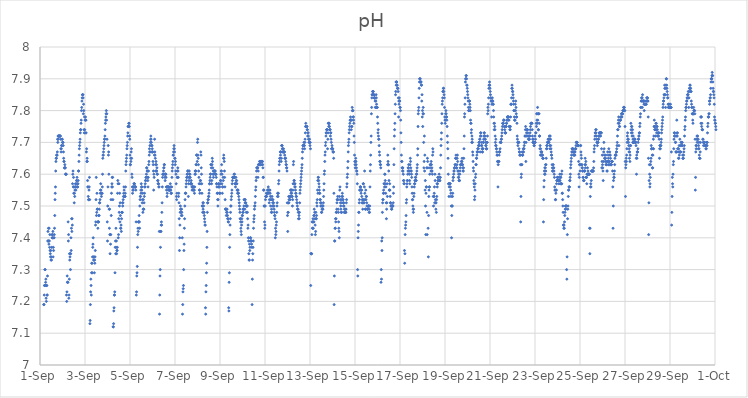
| Category | pH |
|---|---|
| 44440.166666666664 | 7.19 |
| 44440.177083333336 | 7.19 |
| 44440.1875 | 7.22 |
| 44440.197916666664 | 7.25 |
| 44440.208333333336 | 7.25 |
| 44440.21875 | 7.3 |
| 44440.229166666664 | 7.3 |
| 44440.239583333336 | 7.25 |
| 44440.25 | 7.26 |
| 44440.260416666664 | 7.27 |
| 44440.270833333336 | 7.21 |
| 44440.28125 | 7.2 |
| 44440.291666666664 | 7.25 |
| 44440.302083333336 | 7.25 |
| 44440.3125 | 7.22 |
| 44440.322916666664 | 7.22 |
| 44440.333333333336 | 7.28 |
| 44440.34375 | 7.39 |
| 44440.354166666664 | 7.42 |
| 44440.364583333336 | 7.39 |
| 44440.375 | 7.43 |
| 44440.385416666664 | 7.39 |
| 44440.395833333336 | 7.38 |
| 44440.40625 | 7.43 |
| 44440.416666666664 | 7.39 |
| 44440.427083333336 | 7.37 |
| 44440.4375 | 7.41 |
| 44440.447916666664 | 7.36 |
| 44440.458333333336 | 7.35 |
| 44440.46875 | 7.34 |
| 44440.479166666664 | 7.36 |
| 44440.489583333336 | 7.33 |
| 44440.5 | 7.34 |
| 44440.510416666664 | 7.33 |
| 44440.520833333336 | 7.37 |
| 44440.53125 | 7.41 |
| 44440.541666666664 | 7.4 |
| 44440.552083333336 | 7.4 |
| 44440.5625 | 7.41 |
| 44440.572916666664 | 7.42 |
| 44440.583333333336 | 7.34 |
| 44440.59375 | 7.37 |
| 44440.604166666664 | 7.36 |
| 44440.614583333336 | 7.4 |
| 44440.625 | 7.4 |
| 44440.635416666664 | 7.41 |
| 44440.645833333336 | 7.43 |
| 44440.65625 | 7.47 |
| 44440.666666666664 | 7.52 |
| 44440.677083333336 | 7.54 |
| 44440.6875 | 7.56 |
| 44440.697916666664 | 7.61 |
| 44440.708333333336 | 7.64 |
| 44440.71875 | 7.65 |
| 44440.729166666664 | 7.65 |
| 44440.739583333336 | 7.66 |
| 44440.75 | 7.66 |
| 44440.760416666664 | 7.66 |
| 44440.770833333336 | 7.67 |
| 44440.78125 | 7.71 |
| 44440.791666666664 | 7.7 |
| 44440.802083333336 | 7.72 |
| 44440.8125 | 7.71 |
| 44440.822916666664 | 7.72 |
| 44440.833333333336 | 7.72 |
| 44440.84375 | 7.72 |
| 44440.854166666664 | 7.72 |
| 44440.864583333336 | 7.72 |
| 44440.875 | 7.72 |
| 44440.885416666664 | 7.72 |
| 44440.895833333336 | 7.72 |
| 44440.90625 | 7.72 |
| 44440.916666666664 | 7.71 |
| 44440.927083333336 | 7.68 |
| 44440.9375 | 7.67 |
| 44440.947916666664 | 7.68 |
| 44440.958333333336 | 7.69 |
| 44440.96875 | 7.69 |
| 44440.979166666664 | 7.71 |
| 44440.989583333336 | 7.71 |
| 44441.0 | 7.7 |
| 44441.010416666664 | 7.7 |
| 44441.020833333336 | 7.7 |
| 44441.03125 | 7.69 |
| 44441.041666666664 | 7.67 |
| 44441.052083333336 | 7.65 |
| 44441.0625 | 7.64 |
| 44441.072916666664 | 7.64 |
| 44441.083333333336 | 7.62 |
| 44441.09375 | 7.62 |
| 44441.104166666664 | 7.63 |
| 44441.114583333336 | 7.62 |
| 44441.125 | 7.62 |
| 44441.135416666664 | 7.6 |
| 44441.145833333336 | 7.6 |
| 44441.15625 | 7.6 |
| 44441.166666666664 | 7.6 |
| 44441.177083333336 | 7.22 |
| 44441.1875 | 7.2 |
| 44441.197916666664 | 7.23 |
| 44441.208333333336 | 7.28 |
| 44441.21875 | 7.26 |
| 44441.229166666664 | 7.26 |
| 44441.239583333336 | 7.26 |
| 44441.25 | 7.45 |
| 44441.260416666664 | 7.39 |
| 44441.270833333336 | 7.41 |
| 44441.28125 | 7.21 |
| 44441.291666666664 | 7.22 |
| 44441.302083333336 | 7.27 |
| 44441.3125 | 7.35 |
| 44441.322916666664 | 7.33 |
| 44441.333333333336 | 7.34 |
| 44441.34375 | 7.35 |
| 44441.354166666664 | 7.3 |
| 44441.364583333336 | 7.35 |
| 44441.375 | 7.4 |
| 44441.385416666664 | 7.36 |
| 44441.395833333336 | 7.43 |
| 44441.40625 | 7.46 |
| 44441.416666666664 | 7.42 |
| 44441.427083333336 | 7.46 |
| 44441.4375 | 7.44 |
| 44441.447916666664 | 7.57 |
| 44441.458333333336 | 7.6 |
| 44441.46875 | 7.61 |
| 44441.479166666664 | 7.56 |
| 44441.489583333336 | 7.59 |
| 44441.5 | 7.54 |
| 44441.510416666664 | 7.56 |
| 44441.520833333336 | 7.51 |
| 44441.53125 | 7.54 |
| 44441.541666666664 | 7.53 |
| 44441.552083333336 | 7.55 |
| 44441.5625 | 7.56 |
| 44441.572916666664 | 7.57 |
| 44441.583333333336 | 7.56 |
| 44441.59375 | 7.55 |
| 44441.604166666664 | 7.56 |
| 44441.614583333336 | 7.57 |
| 44441.625 | 7.58 |
| 44441.635416666664 | 7.58 |
| 44441.645833333336 | 7.59 |
| 44441.65625 | 7.57 |
| 44441.666666666664 | 7.56 |
| 44441.677083333336 | 7.56 |
| 44441.6875 | 7.57 |
| 44441.697916666664 | 7.58 |
| 44441.708333333336 | 7.61 |
| 44441.71875 | 7.61 |
| 44441.729166666664 | 7.64 |
| 44441.739583333336 | 7.66 |
| 44441.75 | 7.68 |
| 44441.760416666664 | 7.69 |
| 44441.770833333336 | 7.7 |
| 44441.78125 | 7.71 |
| 44441.791666666664 | 7.73 |
| 44441.802083333336 | 7.74 |
| 44441.8125 | 7.74 |
| 44441.822916666664 | 7.76 |
| 44441.833333333336 | 7.77 |
| 44441.84375 | 7.8 |
| 44441.854166666664 | 7.81 |
| 44441.864583333336 | 7.83 |
| 44441.875 | 7.84 |
| 44441.885416666664 | 7.85 |
| 44441.895833333336 | 7.85 |
| 44441.90625 | 7.85 |
| 44441.916666666664 | 7.84 |
| 44441.927083333336 | 7.79 |
| 44441.9375 | 7.82 |
| 44441.947916666664 | 7.8 |
| 44441.958333333336 | 7.74 |
| 44441.96875 | 7.73 |
| 44441.979166666664 | 7.78 |
| 44441.989583333336 | 7.74 |
| 44442.0 | 7.77 |
| 44442.010416666664 | 7.73 |
| 44442.020833333336 | 7.78 |
| 44442.03125 | 7.77 |
| 44442.041666666664 | 7.77 |
| 44442.052083333336 | 7.73 |
| 44442.0625 | 7.67 |
| 44442.072916666664 | 7.68 |
| 44442.083333333336 | 7.64 |
| 44442.09375 | 7.65 |
| 44442.104166666664 | 7.64 |
| 44442.114583333336 | 7.58 |
| 44442.125 | 7.56 |
| 44442.135416666664 | 7.56 |
| 44442.145833333336 | 7.53 |
| 44442.15625 | 7.52 |
| 44442.166666666664 | 7.52 |
| 44442.177083333336 | 7.55 |
| 44442.1875 | 7.56 |
| 44442.197916666664 | 7.59 |
| 44442.208333333336 | 7.52 |
| 44442.21875 | 7.13 |
| 44442.229166666664 | 7.14 |
| 44442.239583333336 | 7.19 |
| 44442.25 | 7.23 |
| 44442.260416666664 | 7.27 |
| 44442.270833333336 | 7.25 |
| 44442.28125 | 7.22 |
| 44442.291666666664 | 7.29 |
| 44442.302083333336 | 7.32 |
| 44442.3125 | 7.32 |
| 44442.322916666664 | 7.29 |
| 44442.333333333336 | 7.34 |
| 44442.34375 | 7.37 |
| 44442.354166666664 | 7.38 |
| 44442.364583333336 | 7.4 |
| 44442.375 | 7.34 |
| 44442.385416666664 | 7.33 |
| 44442.395833333336 | 7.33 |
| 44442.40625 | 7.34 |
| 44442.416666666664 | 7.29 |
| 44442.427083333336 | 7.33 |
| 44442.4375 | 7.32 |
| 44442.447916666664 | 7.34 |
| 44442.458333333336 | 7.36 |
| 44442.46875 | 7.44 |
| 44442.479166666664 | 7.45 |
| 44442.489583333336 | 7.52 |
| 44442.5 | 7.59 |
| 44442.510416666664 | 7.47 |
| 44442.520833333336 | 7.48 |
| 44442.53125 | 7.54 |
| 44442.541666666664 | 7.49 |
| 44442.552083333336 | 7.49 |
| 44442.5625 | 7.45 |
| 44442.572916666664 | 7.43 |
| 44442.583333333336 | 7.45 |
| 44442.59375 | 7.45 |
| 44442.604166666664 | 7.45 |
| 44442.614583333336 | 7.47 |
| 44442.625 | 7.47 |
| 44442.635416666664 | 7.49 |
| 44442.645833333336 | 7.51 |
| 44442.65625 | 7.51 |
| 44442.666666666664 | 7.52 |
| 44442.677083333336 | 7.54 |
| 44442.6875 | 7.55 |
| 44442.697916666664 | 7.57 |
| 44442.708333333336 | 7.55 |
| 44442.71875 | 7.54 |
| 44442.729166666664 | 7.53 |
| 44442.739583333336 | 7.54 |
| 44442.75 | 7.54 |
| 44442.760416666664 | 7.54 |
| 44442.770833333336 | 7.56 |
| 44442.78125 | 7.6 |
| 44442.791666666664 | 7.65 |
| 44442.802083333336 | 7.66 |
| 44442.8125 | 7.66 |
| 44442.822916666664 | 7.67 |
| 44442.833333333336 | 7.68 |
| 44442.84375 | 7.69 |
| 44442.854166666664 | 7.7 |
| 44442.864583333336 | 7.71 |
| 44442.875 | 7.71 |
| 44442.885416666664 | 7.72 |
| 44442.895833333336 | 7.74 |
| 44442.90625 | 7.76 |
| 44442.916666666664 | 7.77 |
| 44442.927083333336 | 7.78 |
| 44442.9375 | 7.79 |
| 44442.947916666664 | 7.8 |
| 44442.958333333336 | 7.77 |
| 44442.96875 | 7.79 |
| 44442.979166666664 | 7.71 |
| 44442.989583333336 | 7.45 |
| 44443.0 | 7.39 |
| 44443.010416666664 | 7.5 |
| 44443.020833333336 | 7.56 |
| 44443.03125 | 7.69 |
| 44443.041666666664 | 7.66 |
| 44443.052083333336 | 7.67 |
| 44443.0625 | 7.6 |
| 44443.072916666664 | 7.49 |
| 44443.083333333336 | 7.43 |
| 44443.09375 | 7.49 |
| 44443.104166666664 | 7.41 |
| 44443.114583333336 | 7.35 |
| 44443.125 | 7.41 |
| 44443.135416666664 | 7.38 |
| 44443.145833333336 | 7.41 |
| 44443.15625 | 7.52 |
| 44443.166666666664 | 7.47 |
| 44443.177083333336 | 7.54 |
| 44443.1875 | 7.56 |
| 44443.197916666664 | 7.57 |
| 44443.208333333336 | 7.59 |
| 44443.21875 | 7.56 |
| 44443.229166666664 | 7.59 |
| 44443.239583333336 | 7.52 |
| 44443.25 | 7.12 |
| 44443.260416666664 | 7.12 |
| 44443.270833333336 | 7.13 |
| 44443.28125 | 7.17 |
| 44443.291666666664 | 7.18 |
| 44443.302083333336 | 7.22 |
| 44443.3125 | 7.22 |
| 44443.322916666664 | 7.23 |
| 44443.333333333336 | 7.29 |
| 44443.34375 | 7.37 |
| 44443.354166666664 | 7.39 |
| 44443.364583333336 | 7.35 |
| 44443.375 | 7.43 |
| 44443.385416666664 | 7.37 |
| 44443.395833333336 | 7.39 |
| 44443.40625 | 7.35 |
| 44443.416666666664 | 7.36 |
| 44443.427083333336 | 7.36 |
| 44443.4375 | 7.37 |
| 44443.447916666664 | 7.54 |
| 44443.458333333336 | 7.58 |
| 44443.46875 | 7.57 |
| 44443.479166666664 | 7.4 |
| 44443.489583333336 | 7.41 |
| 44443.5 | 7.46 |
| 44443.510416666664 | 7.57 |
| 44443.520833333336 | 7.48 |
| 44443.53125 | 7.5 |
| 44443.541666666664 | 7.54 |
| 44443.552083333336 | 7.45 |
| 44443.5625 | 7.51 |
| 44443.572916666664 | 7.47 |
| 44443.583333333336 | 7.43 |
| 44443.59375 | 7.43 |
| 44443.604166666664 | 7.44 |
| 44443.614583333336 | 7.42 |
| 44443.625 | 7.46 |
| 44443.635416666664 | 7.48 |
| 44443.645833333336 | 7.48 |
| 44443.65625 | 7.48 |
| 44443.666666666664 | 7.51 |
| 44443.677083333336 | 7.5 |
| 44443.6875 | 7.51 |
| 44443.697916666664 | 7.52 |
| 44443.708333333336 | 7.53 |
| 44443.71875 | 7.54 |
| 44443.729166666664 | 7.56 |
| 44443.739583333336 | 7.55 |
| 44443.75 | 7.53 |
| 44443.760416666664 | 7.53 |
| 44443.770833333336 | 7.53 |
| 44443.78125 | 7.53 |
| 44443.791666666664 | 7.54 |
| 44443.802083333336 | 7.56 |
| 44443.8125 | 7.61 |
| 44443.822916666664 | 7.63 |
| 44443.833333333336 | 7.64 |
| 44443.84375 | 7.65 |
| 44443.854166666664 | 7.66 |
| 44443.864583333336 | 7.68 |
| 44443.875 | 7.69 |
| 44443.885416666664 | 7.7 |
| 44443.895833333336 | 7.72 |
| 44443.90625 | 7.73 |
| 44443.916666666664 | 7.75 |
| 44443.927083333336 | 7.75 |
| 44443.9375 | 7.75 |
| 44443.947916666664 | 7.76 |
| 44443.958333333336 | 7.76 |
| 44443.96875 | 7.75 |
| 44443.979166666664 | 7.72 |
| 44443.989583333336 | 7.71 |
| 44444.0 | 7.66 |
| 44444.010416666664 | 7.63 |
| 44444.020833333336 | 7.63 |
| 44444.03125 | 7.65 |
| 44444.041666666664 | 7.64 |
| 44444.052083333336 | 7.67 |
| 44444.0625 | 7.68 |
| 44444.072916666664 | 7.65 |
| 44444.083333333336 | 7.6 |
| 44444.09375 | 7.59 |
| 44444.104166666664 | 7.56 |
| 44444.114583333336 | 7.54 |
| 44444.125 | 7.55 |
| 44444.135416666664 | 7.56 |
| 44444.145833333336 | 7.55 |
| 44444.15625 | 7.56 |
| 44444.166666666664 | 7.56 |
| 44444.177083333336 | 7.57 |
| 44444.1875 | 7.57 |
| 44444.197916666664 | 7.57 |
| 44444.208333333336 | 7.56 |
| 44444.21875 | 7.56 |
| 44444.229166666664 | 7.56 |
| 44444.239583333336 | 7.56 |
| 44444.25 | 7.56 |
| 44444.260416666664 | 7.55 |
| 44444.270833333336 | 7.45 |
| 44444.28125 | 7.22 |
| 44444.291666666664 | 7.23 |
| 44444.302083333336 | 7.28 |
| 44444.3125 | 7.29 |
| 44444.322916666664 | 7.31 |
| 44444.333333333336 | 7.37 |
| 44444.34375 | 7.41 |
| 44444.354166666664 | 7.43 |
| 44444.364583333336 | 7.42 |
| 44444.375 | 7.45 |
| 44444.385416666664 | 7.45 |
| 44444.395833333336 | 7.45 |
| 44444.40625 | 7.47 |
| 44444.416666666664 | 7.45 |
| 44444.427083333336 | 7.43 |
| 44444.4375 | 7.5 |
| 44444.447916666664 | 7.52 |
| 44444.458333333336 | 7.53 |
| 44444.46875 | 7.53 |
| 44444.479166666664 | 7.55 |
| 44444.489583333336 | 7.54 |
| 44444.5 | 7.57 |
| 44444.510416666664 | 7.56 |
| 44444.520833333336 | 7.55 |
| 44444.53125 | 7.56 |
| 44444.541666666664 | 7.51 |
| 44444.552083333336 | 7.52 |
| 44444.5625 | 7.54 |
| 44444.572916666664 | 7.48 |
| 44444.583333333336 | 7.49 |
| 44444.59375 | 7.52 |
| 44444.604166666664 | 7.49 |
| 44444.614583333336 | 7.49 |
| 44444.625 | 7.51 |
| 44444.635416666664 | 7.53 |
| 44444.645833333336 | 7.54 |
| 44444.65625 | 7.56 |
| 44444.666666666664 | 7.56 |
| 44444.677083333336 | 7.57 |
| 44444.6875 | 7.58 |
| 44444.697916666664 | 7.58 |
| 44444.708333333336 | 7.59 |
| 44444.71875 | 7.59 |
| 44444.729166666664 | 7.6 |
| 44444.739583333336 | 7.62 |
| 44444.75 | 7.62 |
| 44444.760416666664 | 7.61 |
| 44444.770833333336 | 7.61 |
| 44444.78125 | 7.59 |
| 44444.791666666664 | 7.58 |
| 44444.802083333336 | 7.56 |
| 44444.8125 | 7.59 |
| 44444.822916666664 | 7.61 |
| 44444.833333333336 | 7.63 |
| 44444.84375 | 7.64 |
| 44444.854166666664 | 7.66 |
| 44444.864583333336 | 7.68 |
| 44444.875 | 7.67 |
| 44444.885416666664 | 7.69 |
| 44444.895833333336 | 7.67 |
| 44444.90625 | 7.7 |
| 44444.916666666664 | 7.71 |
| 44444.927083333336 | 7.72 |
| 44444.9375 | 7.71 |
| 44444.947916666664 | 7.7 |
| 44444.958333333336 | 7.69 |
| 44444.96875 | 7.67 |
| 44444.979166666664 | 7.69 |
| 44444.989583333336 | 7.68 |
| 44445.0 | 7.67 |
| 44445.010416666664 | 7.67 |
| 44445.020833333336 | 7.64 |
| 44445.03125 | 7.63 |
| 44445.041666666664 | 7.61 |
| 44445.052083333336 | 7.55 |
| 44445.0625 | 7.6 |
| 44445.072916666664 | 7.59 |
| 44445.083333333336 | 7.66 |
| 44445.09375 | 7.71 |
| 44445.104166666664 | 7.67 |
| 44445.114583333336 | 7.66 |
| 44445.125 | 7.65 |
| 44445.135416666664 | 7.63 |
| 44445.145833333336 | 7.61 |
| 44445.15625 | 7.64 |
| 44445.166666666664 | 7.61 |
| 44445.177083333336 | 7.63 |
| 44445.1875 | 7.61 |
| 44445.197916666664 | 7.62 |
| 44445.208333333336 | 7.6 |
| 44445.21875 | 7.6 |
| 44445.229166666664 | 7.58 |
| 44445.239583333336 | 7.58 |
| 44445.25 | 7.57 |
| 44445.260416666664 | 7.57 |
| 44445.270833333336 | 7.57 |
| 44445.28125 | 7.56 |
| 44445.291666666664 | 7.56 |
| 44445.302083333336 | 7.42 |
| 44445.3125 | 7.16 |
| 44445.322916666664 | 7.22 |
| 44445.333333333336 | 7.28 |
| 44445.34375 | 7.3 |
| 44445.354166666664 | 7.37 |
| 44445.364583333336 | 7.42 |
| 44445.375 | 7.42 |
| 44445.385416666664 | 7.44 |
| 44445.395833333336 | 7.45 |
| 44445.40625 | 7.44 |
| 44445.416666666664 | 7.48 |
| 44445.427083333336 | 7.51 |
| 44445.4375 | 7.56 |
| 44445.447916666664 | 7.59 |
| 44445.458333333336 | 7.6 |
| 44445.46875 | 7.6 |
| 44445.479166666664 | 7.6 |
| 44445.489583333336 | 7.61 |
| 44445.5 | 7.62 |
| 44445.510416666664 | 7.62 |
| 44445.520833333336 | 7.63 |
| 44445.53125 | 7.63 |
| 44445.541666666664 | 7.6 |
| 44445.552083333336 | 7.59 |
| 44445.5625 | 7.58 |
| 44445.572916666664 | 7.6 |
| 44445.583333333336 | 7.6 |
| 44445.59375 | 7.6 |
| 44445.604166666664 | 7.59 |
| 44445.614583333336 | 7.56 |
| 44445.625 | 7.55 |
| 44445.635416666664 | 7.56 |
| 44445.645833333336 | 7.53 |
| 44445.65625 | 7.54 |
| 44445.666666666664 | 7.56 |
| 44445.677083333336 | 7.56 |
| 44445.6875 | 7.56 |
| 44445.697916666664 | 7.56 |
| 44445.708333333336 | 7.55 |
| 44445.71875 | 7.56 |
| 44445.729166666664 | 7.56 |
| 44445.739583333336 | 7.55 |
| 44445.75 | 7.55 |
| 44445.760416666664 | 7.55 |
| 44445.770833333336 | 7.55 |
| 44445.78125 | 7.55 |
| 44445.791666666664 | 7.57 |
| 44445.802083333336 | 7.56 |
| 44445.8125 | 7.55 |
| 44445.822916666664 | 7.54 |
| 44445.833333333336 | 7.54 |
| 44445.84375 | 7.54 |
| 44445.854166666664 | 7.56 |
| 44445.864583333336 | 7.59 |
| 44445.875 | 7.61 |
| 44445.885416666664 | 7.62 |
| 44445.895833333336 | 7.63 |
| 44445.90625 | 7.64 |
| 44445.916666666664 | 7.66 |
| 44445.927083333336 | 7.66 |
| 44445.9375 | 7.67 |
| 44445.947916666664 | 7.68 |
| 44445.958333333336 | 7.69 |
| 44445.96875 | 7.68 |
| 44445.979166666664 | 7.67 |
| 44445.989583333336 | 7.65 |
| 44446.0 | 7.65 |
| 44446.010416666664 | 7.63 |
| 44446.020833333336 | 7.64 |
| 44446.03125 | 7.61 |
| 44446.041666666664 | 7.6 |
| 44446.052083333336 | 7.57 |
| 44446.0625 | 7.53 |
| 44446.072916666664 | 7.52 |
| 44446.083333333336 | 7.54 |
| 44446.09375 | 7.59 |
| 44446.104166666664 | 7.61 |
| 44446.114583333336 | 7.59 |
| 44446.125 | 7.62 |
| 44446.135416666664 | 7.61 |
| 44446.145833333336 | 7.59 |
| 44446.15625 | 7.53 |
| 44446.166666666664 | 7.54 |
| 44446.177083333336 | 7.51 |
| 44446.1875 | 7.46 |
| 44446.197916666664 | 7.36 |
| 44446.208333333336 | 7.4 |
| 44446.21875 | 7.44 |
| 44446.229166666664 | 7.48 |
| 44446.239583333336 | 7.5 |
| 44446.25 | 7.49 |
| 44446.260416666664 | 7.49 |
| 44446.270833333336 | 7.48 |
| 44446.28125 | 7.47 |
| 44446.291666666664 | 7.49 |
| 44446.302083333336 | 7.48 |
| 44446.3125 | 7.47 |
| 44446.322916666664 | 7.4 |
| 44446.333333333336 | 7.16 |
| 44446.34375 | 7.19 |
| 44446.354166666664 | 7.23 |
| 44446.364583333336 | 7.24 |
| 44446.375 | 7.25 |
| 44446.385416666664 | 7.3 |
| 44446.395833333336 | 7.36 |
| 44446.40625 | 7.38 |
| 44446.416666666664 | 7.43 |
| 44446.427083333336 | 7.46 |
| 44446.4375 | 7.5 |
| 44446.447916666664 | 7.52 |
| 44446.458333333336 | 7.54 |
| 44446.46875 | 7.54 |
| 44446.479166666664 | 7.54 |
| 44446.489583333336 | 7.56 |
| 44446.5 | 7.57 |
| 44446.510416666664 | 7.58 |
| 44446.520833333336 | 7.59 |
| 44446.53125 | 7.59 |
| 44446.541666666664 | 7.6 |
| 44446.552083333336 | 7.6 |
| 44446.5625 | 7.61 |
| 44446.572916666664 | 7.61 |
| 44446.583333333336 | 7.61 |
| 44446.59375 | 7.53 |
| 44446.604166666664 | 7.57 |
| 44446.614583333336 | 7.59 |
| 44446.625 | 7.58 |
| 44446.635416666664 | 7.61 |
| 44446.645833333336 | 7.6 |
| 44446.65625 | 7.59 |
| 44446.666666666664 | 7.6 |
| 44446.677083333336 | 7.59 |
| 44446.6875 | 7.57 |
| 44446.697916666664 | 7.57 |
| 44446.708333333336 | 7.57 |
| 44446.71875 | 7.58 |
| 44446.729166666664 | 7.57 |
| 44446.739583333336 | 7.57 |
| 44446.75 | 7.56 |
| 44446.760416666664 | 7.55 |
| 44446.770833333336 | 7.56 |
| 44446.78125 | 7.56 |
| 44446.791666666664 | 7.56 |
| 44446.802083333336 | 7.55 |
| 44446.8125 | 7.56 |
| 44446.822916666664 | 7.55 |
| 44446.833333333336 | 7.56 |
| 44446.84375 | 7.55 |
| 44446.854166666664 | 7.55 |
| 44446.864583333336 | 7.54 |
| 44446.875 | 7.56 |
| 44446.885416666664 | 7.6 |
| 44446.895833333336 | 7.61 |
| 44446.90625 | 7.6 |
| 44446.916666666664 | 7.61 |
| 44446.927083333336 | 7.61 |
| 44446.9375 | 7.63 |
| 44446.947916666664 | 7.63 |
| 44446.958333333336 | 7.66 |
| 44446.96875 | 7.66 |
| 44446.979166666664 | 7.66 |
| 44446.989583333336 | 7.64 |
| 44447.0 | 7.7 |
| 44447.010416666664 | 7.71 |
| 44447.020833333336 | 7.66 |
| 44447.03125 | 7.65 |
| 44447.041666666664 | 7.63 |
| 44447.052083333336 | 7.61 |
| 44447.0625 | 7.59 |
| 44447.072916666664 | 7.57 |
| 44447.083333333336 | 7.55 |
| 44447.09375 | 7.55 |
| 44447.104166666664 | 7.54 |
| 44447.114583333336 | 7.57 |
| 44447.125 | 7.58 |
| 44447.135416666664 | 7.58 |
| 44447.145833333336 | 7.67 |
| 44447.15625 | 7.66 |
| 44447.166666666664 | 7.62 |
| 44447.177083333336 | 7.6 |
| 44447.1875 | 7.57 |
| 44447.197916666664 | 7.54 |
| 44447.208333333336 | 7.5 |
| 44447.21875 | 7.5 |
| 44447.229166666664 | 7.48 |
| 44447.239583333336 | 7.51 |
| 44447.25 | 7.49 |
| 44447.260416666664 | 7.51 |
| 44447.270833333336 | 7.5 |
| 44447.28125 | 7.48 |
| 44447.291666666664 | 7.48 |
| 44447.302083333336 | 7.47 |
| 44447.3125 | 7.46 |
| 44447.322916666664 | 7.45 |
| 44447.333333333336 | 7.44 |
| 44447.34375 | 7.44 |
| 44447.354166666664 | 7.18 |
| 44447.364583333336 | 7.16 |
| 44447.375 | 7.23 |
| 44447.385416666664 | 7.25 |
| 44447.395833333336 | 7.29 |
| 44447.40625 | 7.32 |
| 44447.416666666664 | 7.37 |
| 44447.427083333336 | 7.42 |
| 44447.4375 | 7.48 |
| 44447.447916666664 | 7.51 |
| 44447.458333333336 | 7.51 |
| 44447.46875 | 7.52 |
| 44447.479166666664 | 7.52 |
| 44447.489583333336 | 7.53 |
| 44447.5 | 7.53 |
| 44447.510416666664 | 7.54 |
| 44447.520833333336 | 7.55 |
| 44447.53125 | 7.57 |
| 44447.541666666664 | 7.57 |
| 44447.552083333336 | 7.58 |
| 44447.5625 | 7.59 |
| 44447.572916666664 | 7.6 |
| 44447.583333333336 | 7.6 |
| 44447.59375 | 7.63 |
| 44447.604166666664 | 7.63 |
| 44447.614583333336 | 7.62 |
| 44447.625 | 7.57 |
| 44447.635416666664 | 7.58 |
| 44447.645833333336 | 7.63 |
| 44447.65625 | 7.65 |
| 44447.666666666664 | 7.64 |
| 44447.677083333336 | 7.62 |
| 44447.6875 | 7.6 |
| 44447.697916666664 | 7.61 |
| 44447.708333333336 | 7.59 |
| 44447.71875 | 7.6 |
| 44447.729166666664 | 7.61 |
| 44447.739583333336 | 7.61 |
| 44447.75 | 7.61 |
| 44447.760416666664 | 7.61 |
| 44447.770833333336 | 7.61 |
| 44447.78125 | 7.6 |
| 44447.791666666664 | 7.61 |
| 44447.802083333336 | 7.6 |
| 44447.8125 | 7.6 |
| 44447.822916666664 | 7.6 |
| 44447.833333333336 | 7.59 |
| 44447.84375 | 7.57 |
| 44447.854166666664 | 7.57 |
| 44447.864583333336 | 7.56 |
| 44447.875 | 7.54 |
| 44447.885416666664 | 7.54 |
| 44447.895833333336 | 7.52 |
| 44447.90625 | 7.5 |
| 44447.916666666664 | 7.52 |
| 44447.927083333336 | 7.56 |
| 44447.9375 | 7.57 |
| 44447.947916666664 | 7.57 |
| 44447.958333333336 | 7.56 |
| 44447.96875 | 7.54 |
| 44447.979166666664 | 7.56 |
| 44447.989583333336 | 7.54 |
| 44448.0 | 7.54 |
| 44448.010416666664 | 7.57 |
| 44448.020833333336 | 7.58 |
| 44448.03125 | 7.58 |
| 44448.041666666664 | 7.6 |
| 44448.052083333336 | 7.61 |
| 44448.0625 | 7.61 |
| 44448.072916666664 | 7.63 |
| 44448.083333333336 | 7.57 |
| 44448.09375 | 7.6 |
| 44448.104166666664 | 7.54 |
| 44448.114583333336 | 7.56 |
| 44448.125 | 7.56 |
| 44448.135416666664 | 7.59 |
| 44448.145833333336 | 7.58 |
| 44448.15625 | 7.65 |
| 44448.166666666664 | 7.66 |
| 44448.177083333336 | 7.65 |
| 44448.1875 | 7.64 |
| 44448.197916666664 | 7.61 |
| 44448.208333333336 | 7.59 |
| 44448.21875 | 7.56 |
| 44448.229166666664 | 7.52 |
| 44448.239583333336 | 7.49 |
| 44448.25 | 7.49 |
| 44448.260416666664 | 7.49 |
| 44448.270833333336 | 7.49 |
| 44448.28125 | 7.47 |
| 44448.291666666664 | 7.48 |
| 44448.302083333336 | 7.49 |
| 44448.3125 | 7.49 |
| 44448.322916666664 | 7.48 |
| 44448.333333333336 | 7.47 |
| 44448.34375 | 7.46 |
| 44448.354166666664 | 7.46 |
| 44448.364583333336 | 7.45 |
| 44448.375 | 7.45 |
| 44448.385416666664 | 7.18 |
| 44448.395833333336 | 7.17 |
| 44448.40625 | 7.26 |
| 44448.416666666664 | 7.29 |
| 44448.427083333336 | 7.37 |
| 44448.4375 | 7.41 |
| 44448.447916666664 | 7.44 |
| 44448.458333333336 | 7.46 |
| 44448.46875 | 7.48 |
| 44448.479166666664 | 7.5 |
| 44448.489583333336 | 7.5 |
| 44448.5 | 7.52 |
| 44448.510416666664 | 7.53 |
| 44448.520833333336 | 7.54 |
| 44448.53125 | 7.55 |
| 44448.541666666664 | 7.57 |
| 44448.552083333336 | 7.58 |
| 44448.5625 | 7.59 |
| 44448.572916666664 | 7.59 |
| 44448.583333333336 | 7.59 |
| 44448.59375 | 7.59 |
| 44448.604166666664 | 7.59 |
| 44448.614583333336 | 7.59 |
| 44448.625 | 7.6 |
| 44448.635416666664 | 7.59 |
| 44448.645833333336 | 7.6 |
| 44448.65625 | 7.59 |
| 44448.666666666664 | 7.57 |
| 44448.677083333336 | 7.57 |
| 44448.6875 | 7.56 |
| 44448.697916666664 | 7.57 |
| 44448.708333333336 | 7.59 |
| 44448.71875 | 7.58 |
| 44448.729166666664 | 7.57 |
| 44448.739583333336 | 7.58 |
| 44448.75 | 7.57 |
| 44448.760416666664 | 7.55 |
| 44448.770833333336 | 7.55 |
| 44448.78125 | 7.54 |
| 44448.791666666664 | 7.55 |
| 44448.802083333336 | 7.55 |
| 44448.8125 | 7.54 |
| 44448.822916666664 | 7.54 |
| 44448.833333333336 | 7.53 |
| 44448.84375 | 7.52 |
| 44448.854166666664 | 7.51 |
| 44448.864583333336 | 7.5 |
| 44448.875 | 7.49 |
| 44448.885416666664 | 7.48 |
| 44448.895833333336 | 7.46 |
| 44448.90625 | 7.46 |
| 44448.916666666664 | 7.45 |
| 44448.927083333336 | 7.43 |
| 44448.9375 | 7.42 |
| 44448.947916666664 | 7.41 |
| 44448.958333333336 | 7.44 |
| 44448.96875 | 7.46 |
| 44448.979166666664 | 7.45 |
| 44448.989583333336 | 7.47 |
| 44449.0 | 7.47 |
| 44449.010416666664 | 7.48 |
| 44449.020833333336 | 7.49 |
| 44449.03125 | 7.48 |
| 44449.041666666664 | 7.49 |
| 44449.052083333336 | 7.49 |
| 44449.0625 | 7.5 |
| 44449.072916666664 | 7.52 |
| 44449.083333333336 | 7.52 |
| 44449.09375 | 7.52 |
| 44449.104166666664 | 7.49 |
| 44449.114583333336 | 7.51 |
| 44449.125 | 7.52 |
| 44449.135416666664 | 7.51 |
| 44449.145833333336 | 7.51 |
| 44449.15625 | 7.5 |
| 44449.166666666664 | 7.48 |
| 44449.177083333336 | 7.5 |
| 44449.1875 | 7.5 |
| 44449.197916666664 | 7.5 |
| 44449.208333333336 | 7.5 |
| 44449.21875 | 7.48 |
| 44449.229166666664 | 7.46 |
| 44449.239583333336 | 7.43 |
| 44449.25 | 7.44 |
| 44449.260416666664 | 7.4 |
| 44449.270833333336 | 7.39 |
| 44449.28125 | 7.35 |
| 44449.291666666664 | 7.33 |
| 44449.302083333336 | 7.33 |
| 44449.3125 | 7.38 |
| 44449.322916666664 | 7.36 |
| 44449.333333333336 | 7.37 |
| 44449.34375 | 7.4 |
| 44449.354166666664 | 7.39 |
| 44449.364583333336 | 7.4 |
| 44449.375 | 7.39 |
| 44449.385416666664 | 7.39 |
| 44449.395833333336 | 7.39 |
| 44449.40625 | 7.38 |
| 44449.416666666664 | 7.37 |
| 44449.427083333336 | 7.19 |
| 44449.4375 | 7.27 |
| 44449.447916666664 | 7.33 |
| 44449.458333333336 | 7.35 |
| 44449.46875 | 7.37 |
| 44449.479166666664 | 7.39 |
| 44449.489583333336 | 7.43 |
| 44449.5 | 7.45 |
| 44449.510416666664 | 7.46 |
| 44449.520833333336 | 7.47 |
| 44449.53125 | 7.49 |
| 44449.541666666664 | 7.5 |
| 44449.552083333336 | 7.5 |
| 44449.5625 | 7.51 |
| 44449.572916666664 | 7.53 |
| 44449.583333333336 | 7.55 |
| 44449.59375 | 7.56 |
| 44449.604166666664 | 7.58 |
| 44449.614583333336 | 7.59 |
| 44449.625 | 7.61 |
| 44449.635416666664 | 7.62 |
| 44449.645833333336 | 7.62 |
| 44449.65625 | 7.62 |
| 44449.666666666664 | 7.62 |
| 44449.677083333336 | 7.62 |
| 44449.6875 | 7.59 |
| 44449.697916666664 | 7.61 |
| 44449.708333333336 | 7.63 |
| 44449.71875 | 7.63 |
| 44449.729166666664 | 7.63 |
| 44449.739583333336 | 7.63 |
| 44449.75 | 7.63 |
| 44449.760416666664 | 7.64 |
| 44449.770833333336 | 7.64 |
| 44449.78125 | 7.63 |
| 44449.791666666664 | 7.63 |
| 44449.802083333336 | 7.64 |
| 44449.8125 | 7.63 |
| 44449.822916666664 | 7.64 |
| 44449.833333333336 | 7.64 |
| 44449.84375 | 7.64 |
| 44449.854166666664 | 7.64 |
| 44449.864583333336 | 7.63 |
| 44449.875 | 7.64 |
| 44449.885416666664 | 7.64 |
| 44449.895833333336 | 7.63 |
| 44449.90625 | 7.62 |
| 44449.916666666664 | 7.59 |
| 44449.927083333336 | 7.59 |
| 44449.9375 | 7.55 |
| 44449.947916666664 | 7.55 |
| 44449.958333333336 | 7.5 |
| 44449.96875 | 7.5 |
| 44449.979166666664 | 7.45 |
| 44449.989583333336 | 7.43 |
| 44450.0 | 7.44 |
| 44450.010416666664 | 7.5 |
| 44450.020833333336 | 7.52 |
| 44450.03125 | 7.53 |
| 44450.041666666664 | 7.53 |
| 44450.052083333336 | 7.53 |
| 44450.0625 | 7.54 |
| 44450.072916666664 | 7.53 |
| 44450.083333333336 | 7.54 |
| 44450.09375 | 7.54 |
| 44450.104166666664 | 7.54 |
| 44450.114583333336 | 7.55 |
| 44450.125 | 7.55 |
| 44450.135416666664 | 7.54 |
| 44450.145833333336 | 7.56 |
| 44450.15625 | 7.55 |
| 44450.166666666664 | 7.55 |
| 44450.177083333336 | 7.54 |
| 44450.1875 | 7.51 |
| 44450.197916666664 | 7.52 |
| 44450.208333333336 | 7.55 |
| 44450.21875 | 7.55 |
| 44450.229166666664 | 7.54 |
| 44450.239583333336 | 7.53 |
| 44450.25 | 7.5 |
| 44450.260416666664 | 7.52 |
| 44450.270833333336 | 7.52 |
| 44450.28125 | 7.48 |
| 44450.291666666664 | 7.49 |
| 44450.302083333336 | 7.48 |
| 44450.3125 | 7.53 |
| 44450.322916666664 | 7.52 |
| 44450.333333333336 | 7.5 |
| 44450.34375 | 7.51 |
| 44450.354166666664 | 7.52 |
| 44450.364583333336 | 7.51 |
| 44450.375 | 7.51 |
| 44450.385416666664 | 7.5 |
| 44450.395833333336 | 7.5 |
| 44450.40625 | 7.49 |
| 44450.416666666664 | 7.48 |
| 44450.427083333336 | 7.47 |
| 44450.4375 | 7.47 |
| 44450.447916666664 | 7.46 |
| 44450.458333333336 | 7.4 |
| 44450.46875 | 7.43 |
| 44450.479166666664 | 7.41 |
| 44450.489583333336 | 7.42 |
| 44450.5 | 7.44 |
| 44450.510416666664 | 7.45 |
| 44450.520833333336 | 7.48 |
| 44450.53125 | 7.5 |
| 44450.541666666664 | 7.51 |
| 44450.552083333336 | 7.53 |
| 44450.5625 | 7.54 |
| 44450.572916666664 | 7.54 |
| 44450.583333333336 | 7.53 |
| 44450.59375 | 7.54 |
| 44450.604166666664 | 7.57 |
| 44450.614583333336 | 7.58 |
| 44450.625 | 7.61 |
| 44450.635416666664 | 7.63 |
| 44450.645833333336 | 7.64 |
| 44450.65625 | 7.65 |
| 44450.666666666664 | 7.65 |
| 44450.677083333336 | 7.67 |
| 44450.6875 | 7.66 |
| 44450.697916666664 | 7.67 |
| 44450.708333333336 | 7.67 |
| 44450.71875 | 7.64 |
| 44450.729166666664 | 7.65 |
| 44450.739583333336 | 7.69 |
| 44450.75 | 7.69 |
| 44450.760416666664 | 7.69 |
| 44450.770833333336 | 7.68 |
| 44450.78125 | 7.68 |
| 44450.791666666664 | 7.67 |
| 44450.802083333336 | 7.67 |
| 44450.8125 | 7.67 |
| 44450.822916666664 | 7.68 |
| 44450.833333333336 | 7.67 |
| 44450.84375 | 7.67 |
| 44450.854166666664 | 7.67 |
| 44450.864583333336 | 7.67 |
| 44450.875 | 7.66 |
| 44450.885416666664 | 7.65 |
| 44450.895833333336 | 7.65 |
| 44450.90625 | 7.65 |
| 44450.916666666664 | 7.65 |
| 44450.927083333336 | 7.64 |
| 44450.9375 | 7.63 |
| 44450.947916666664 | 7.63 |
| 44450.958333333336 | 7.62 |
| 44450.96875 | 7.62 |
| 44450.979166666664 | 7.61 |
| 44450.989583333336 | 7.51 |
| 44451.0 | 7.47 |
| 44451.010416666664 | 7.42 |
| 44451.020833333336 | 7.48 |
| 44451.03125 | 7.48 |
| 44451.041666666664 | 7.51 |
| 44451.052083333336 | 7.53 |
| 44451.0625 | 7.51 |
| 44451.072916666664 | 7.52 |
| 44451.083333333336 | 7.52 |
| 44451.09375 | 7.53 |
| 44451.104166666664 | 7.53 |
| 44451.114583333336 | 7.52 |
| 44451.125 | 7.53 |
| 44451.135416666664 | 7.55 |
| 44451.145833333336 | 7.55 |
| 44451.15625 | 7.54 |
| 44451.166666666664 | 7.55 |
| 44451.177083333336 | 7.55 |
| 44451.1875 | 7.54 |
| 44451.197916666664 | 7.53 |
| 44451.208333333336 | 7.53 |
| 44451.21875 | 7.5 |
| 44451.229166666664 | 7.52 |
| 44451.239583333336 | 7.55 |
| 44451.25 | 7.57 |
| 44451.260416666664 | 7.63 |
| 44451.270833333336 | 7.64 |
| 44451.28125 | 7.57 |
| 44451.291666666664 | 7.58 |
| 44451.302083333336 | 7.58 |
| 44451.3125 | 7.57 |
| 44451.322916666664 | 7.56 |
| 44451.333333333336 | 7.57 |
| 44451.34375 | 7.56 |
| 44451.354166666664 | 7.55 |
| 44451.364583333336 | 7.54 |
| 44451.375 | 7.54 |
| 44451.385416666664 | 7.53 |
| 44451.395833333336 | 7.53 |
| 44451.40625 | 7.52 |
| 44451.416666666664 | 7.51 |
| 44451.427083333336 | 7.51 |
| 44451.4375 | 7.5 |
| 44451.447916666664 | 7.49 |
| 44451.458333333336 | 7.49 |
| 44451.46875 | 7.49 |
| 44451.479166666664 | 7.48 |
| 44451.489583333336 | 7.46 |
| 44451.5 | 7.48 |
| 44451.510416666664 | 7.47 |
| 44451.520833333336 | 7.46 |
| 44451.53125 | 7.48 |
| 44451.541666666664 | 7.51 |
| 44451.552083333336 | 7.54 |
| 44451.5625 | 7.55 |
| 44451.572916666664 | 7.56 |
| 44451.583333333336 | 7.57 |
| 44451.59375 | 7.58 |
| 44451.604166666664 | 7.59 |
| 44451.614583333336 | 7.6 |
| 44451.625 | 7.61 |
| 44451.635416666664 | 7.62 |
| 44451.645833333336 | 7.63 |
| 44451.65625 | 7.65 |
| 44451.666666666664 | 7.67 |
| 44451.677083333336 | 7.68 |
| 44451.6875 | 7.69 |
| 44451.697916666664 | 7.69 |
| 44451.708333333336 | 7.69 |
| 44451.71875 | 7.69 |
| 44451.729166666664 | 7.7 |
| 44451.739583333336 | 7.69 |
| 44451.75 | 7.69 |
| 44451.760416666664 | 7.68 |
| 44451.770833333336 | 7.7 |
| 44451.78125 | 7.71 |
| 44451.791666666664 | 7.73 |
| 44451.802083333336 | 7.75 |
| 44451.8125 | 7.76 |
| 44451.822916666664 | 7.75 |
| 44451.833333333336 | 7.75 |
| 44451.84375 | 7.75 |
| 44451.854166666664 | 7.75 |
| 44451.864583333336 | 7.75 |
| 44451.875 | 7.74 |
| 44451.885416666664 | 7.74 |
| 44451.895833333336 | 7.72 |
| 44451.90625 | 7.73 |
| 44451.916666666664 | 7.73 |
| 44451.927083333336 | 7.72 |
| 44451.9375 | 7.71 |
| 44451.947916666664 | 7.71 |
| 44451.958333333336 | 7.7 |
| 44451.96875 | 7.7 |
| 44451.979166666664 | 7.71 |
| 44451.989583333336 | 7.7 |
| 44452.0 | 7.69 |
| 44452.010416666664 | 7.7 |
| 44452.020833333336 | 7.68 |
| 44452.03125 | 7.25 |
| 44452.041666666664 | 7.35 |
| 44452.052083333336 | 7.35 |
| 44452.0625 | 7.35 |
| 44452.072916666664 | 7.35 |
| 44452.083333333336 | 7.41 |
| 44452.09375 | 7.45 |
| 44452.104166666664 | 7.43 |
| 44452.114583333336 | 7.45 |
| 44452.125 | 7.43 |
| 44452.135416666664 | 7.46 |
| 44452.145833333336 | 7.43 |
| 44452.15625 | 7.45 |
| 44452.166666666664 | 7.47 |
| 44452.177083333336 | 7.45 |
| 44452.1875 | 7.49 |
| 44452.197916666664 | 7.47 |
| 44452.208333333336 | 7.48 |
| 44452.21875 | 7.46 |
| 44452.229166666664 | 7.44 |
| 44452.239583333336 | 7.41 |
| 44452.25 | 7.42 |
| 44452.260416666664 | 7.48 |
| 44452.270833333336 | 7.46 |
| 44452.28125 | 7.46 |
| 44452.291666666664 | 7.47 |
| 44452.302083333336 | 7.51 |
| 44452.3125 | 7.5 |
| 44452.322916666664 | 7.52 |
| 44452.333333333336 | 7.55 |
| 44452.34375 | 7.58 |
| 44452.354166666664 | 7.54 |
| 44452.364583333336 | 7.59 |
| 44452.375 | 7.59 |
| 44452.385416666664 | 7.58 |
| 44452.395833333336 | 7.57 |
| 44452.40625 | 7.56 |
| 44452.416666666664 | 7.55 |
| 44452.427083333336 | 7.54 |
| 44452.4375 | 7.54 |
| 44452.447916666664 | 7.52 |
| 44452.458333333336 | 7.52 |
| 44452.46875 | 7.51 |
| 44452.479166666664 | 7.5 |
| 44452.489583333336 | 7.51 |
| 44452.5 | 7.5 |
| 44452.510416666664 | 7.48 |
| 44452.520833333336 | 7.48 |
| 44452.53125 | 7.49 |
| 44452.541666666664 | 7.5 |
| 44452.552083333336 | 7.5 |
| 44452.5625 | 7.49 |
| 44452.572916666664 | 7.49 |
| 44452.583333333336 | 7.5 |
| 44452.59375 | 7.51 |
| 44452.604166666664 | 7.53 |
| 44452.614583333336 | 7.55 |
| 44452.625 | 7.57 |
| 44452.635416666664 | 7.6 |
| 44452.645833333336 | 7.61 |
| 44452.65625 | 7.64 |
| 44452.666666666664 | 7.66 |
| 44452.677083333336 | 7.67 |
| 44452.6875 | 7.69 |
| 44452.697916666664 | 7.7 |
| 44452.708333333336 | 7.72 |
| 44452.71875 | 7.73 |
| 44452.729166666664 | 7.73 |
| 44452.739583333336 | 7.74 |
| 44452.75 | 7.74 |
| 44452.760416666664 | 7.74 |
| 44452.770833333336 | 7.74 |
| 44452.78125 | 7.68 |
| 44452.791666666664 | 7.71 |
| 44452.802083333336 | 7.73 |
| 44452.8125 | 7.76 |
| 44452.822916666664 | 7.76 |
| 44452.833333333336 | 7.75 |
| 44452.84375 | 7.76 |
| 44452.854166666664 | 7.76 |
| 44452.864583333336 | 7.75 |
| 44452.875 | 7.74 |
| 44452.885416666664 | 7.74 |
| 44452.895833333336 | 7.74 |
| 44452.90625 | 7.72 |
| 44452.916666666664 | 7.73 |
| 44452.927083333336 | 7.73 |
| 44452.9375 | 7.71 |
| 44452.947916666664 | 7.7 |
| 44452.958333333336 | 7.68 |
| 44452.96875 | 7.68 |
| 44452.979166666664 | 7.69 |
| 44452.989583333336 | 7.68 |
| 44453.0 | 7.68 |
| 44453.010416666664 | 7.68 |
| 44453.020833333336 | 7.67 |
| 44453.03125 | 7.67 |
| 44453.041666666664 | 7.67 |
| 44453.052083333336 | 7.65 |
| 44453.0625 | 7.54 |
| 44453.072916666664 | 7.19 |
| 44453.083333333336 | 7.28 |
| 44453.09375 | 7.39 |
| 44453.104166666664 | 7.39 |
| 44453.114583333336 | 7.43 |
| 44453.125 | 7.43 |
| 44453.135416666664 | 7.46 |
| 44453.145833333336 | 7.45 |
| 44453.15625 | 7.46 |
| 44453.166666666664 | 7.48 |
| 44453.177083333336 | 7.48 |
| 44453.1875 | 7.49 |
| 44453.197916666664 | 7.51 |
| 44453.208333333336 | 7.52 |
| 44453.21875 | 7.52 |
| 44453.229166666664 | 7.53 |
| 44453.239583333336 | 7.52 |
| 44453.25 | 7.49 |
| 44453.260416666664 | 7.48 |
| 44453.270833333336 | 7.45 |
| 44453.28125 | 7.43 |
| 44453.291666666664 | 7.42 |
| 44453.302083333336 | 7.4 |
| 44453.3125 | 7.53 |
| 44453.322916666664 | 7.55 |
| 44453.333333333336 | 7.56 |
| 44453.34375 | 7.52 |
| 44453.354166666664 | 7.51 |
| 44453.364583333336 | 7.5 |
| 44453.375 | 7.49 |
| 44453.385416666664 | 7.48 |
| 44453.395833333336 | 7.52 |
| 44453.40625 | 7.48 |
| 44453.416666666664 | 7.51 |
| 44453.427083333336 | 7.53 |
| 44453.4375 | 7.54 |
| 44453.447916666664 | 7.53 |
| 44453.458333333336 | 7.52 |
| 44453.46875 | 7.52 |
| 44453.479166666664 | 7.51 |
| 44453.489583333336 | 7.5 |
| 44453.5 | 7.51 |
| 44453.510416666664 | 7.5 |
| 44453.520833333336 | 7.48 |
| 44453.53125 | 7.49 |
| 44453.541666666664 | 7.48 |
| 44453.552083333336 | 7.49 |
| 44453.5625 | 7.49 |
| 44453.572916666664 | 7.48 |
| 44453.583333333336 | 7.48 |
| 44453.59375 | 7.48 |
| 44453.604166666664 | 7.49 |
| 44453.614583333336 | 7.51 |
| 44453.625 | 7.52 |
| 44453.635416666664 | 7.56 |
| 44453.645833333336 | 7.57 |
| 44453.65625 | 7.59 |
| 44453.666666666664 | 7.6 |
| 44453.677083333336 | 7.62 |
| 44453.6875 | 7.64 |
| 44453.697916666664 | 7.67 |
| 44453.708333333336 | 7.69 |
| 44453.71875 | 7.7 |
| 44453.729166666664 | 7.71 |
| 44453.739583333336 | 7.73 |
| 44453.75 | 7.74 |
| 44453.760416666664 | 7.75 |
| 44453.770833333336 | 7.76 |
| 44453.78125 | 7.77 |
| 44453.791666666664 | 7.77 |
| 44453.802083333336 | 7.78 |
| 44453.8125 | 7.77 |
| 44453.822916666664 | 7.77 |
| 44453.833333333336 | 7.74 |
| 44453.84375 | 7.75 |
| 44453.854166666664 | 7.77 |
| 44453.864583333336 | 7.75 |
| 44453.875 | 7.81 |
| 44453.885416666664 | 7.8 |
| 44453.895833333336 | 7.8 |
| 44453.90625 | 7.8 |
| 44453.916666666664 | 7.78 |
| 44453.927083333336 | 7.78 |
| 44453.9375 | 7.77 |
| 44453.947916666664 | 7.76 |
| 44453.958333333336 | 7.72 |
| 44453.96875 | 7.7 |
| 44453.979166666664 | 7.66 |
| 44453.989583333336 | 7.64 |
| 44454.0 | 7.63 |
| 44454.010416666664 | 7.62 |
| 44454.020833333336 | 7.64 |
| 44454.03125 | 7.65 |
| 44454.041666666664 | 7.64 |
| 44454.052083333336 | 7.63 |
| 44454.0625 | 7.62 |
| 44454.072916666664 | 7.61 |
| 44454.083333333336 | 7.61 |
| 44454.09375 | 7.6 |
| 44454.104166666664 | 7.57 |
| 44454.114583333336 | 7.3 |
| 44454.125 | 7.28 |
| 44454.135416666664 | 7.4 |
| 44454.145833333336 | 7.42 |
| 44454.15625 | 7.44 |
| 44454.166666666664 | 7.48 |
| 44454.177083333336 | 7.48 |
| 44454.1875 | 7.51 |
| 44454.197916666664 | 7.52 |
| 44454.208333333336 | 7.55 |
| 44454.21875 | 7.55 |
| 44454.229166666664 | 7.56 |
| 44454.239583333336 | 7.56 |
| 44454.25 | 7.56 |
| 44454.260416666664 | 7.55 |
| 44454.270833333336 | 7.54 |
| 44454.28125 | 7.55 |
| 44454.291666666664 | 7.55 |
| 44454.302083333336 | 7.53 |
| 44454.3125 | 7.51 |
| 44454.322916666664 | 7.52 |
| 44454.333333333336 | 7.51 |
| 44454.34375 | 7.49 |
| 44454.354166666664 | 7.52 |
| 44454.364583333336 | 7.57 |
| 44454.375 | 7.57 |
| 44454.385416666664 | 7.51 |
| 44454.395833333336 | 7.52 |
| 44454.40625 | 7.51 |
| 44454.416666666664 | 7.56 |
| 44454.427083333336 | 7.61 |
| 44454.4375 | 7.54 |
| 44454.447916666664 | 7.52 |
| 44454.458333333336 | 7.49 |
| 44454.46875 | 7.49 |
| 44454.479166666664 | 7.55 |
| 44454.489583333336 | 7.52 |
| 44454.5 | 7.53 |
| 44454.510416666664 | 7.53 |
| 44454.520833333336 | 7.51 |
| 44454.53125 | 7.5 |
| 44454.541666666664 | 7.49 |
| 44454.552083333336 | 7.49 |
| 44454.5625 | 7.49 |
| 44454.572916666664 | 7.49 |
| 44454.583333333336 | 7.5 |
| 44454.59375 | 7.5 |
| 44454.604166666664 | 7.5 |
| 44454.614583333336 | 7.5 |
| 44454.625 | 7.48 |
| 44454.635416666664 | 7.49 |
| 44454.645833333336 | 7.48 |
| 44454.65625 | 7.5 |
| 44454.666666666664 | 7.56 |
| 44454.677083333336 | 7.61 |
| 44454.6875 | 7.63 |
| 44454.697916666664 | 7.66 |
| 44454.708333333336 | 7.7 |
| 44454.71875 | 7.72 |
| 44454.729166666664 | 7.79 |
| 44454.739583333336 | 7.81 |
| 44454.75 | 7.84 |
| 44454.760416666664 | 7.85 |
| 44454.770833333336 | 7.85 |
| 44454.78125 | 7.86 |
| 44454.791666666664 | 7.85 |
| 44454.802083333336 | 7.86 |
| 44454.8125 | 7.86 |
| 44454.822916666664 | 7.85 |
| 44454.833333333336 | 7.85 |
| 44454.84375 | 7.85 |
| 44454.854166666664 | 7.84 |
| 44454.864583333336 | 7.84 |
| 44454.875 | 7.84 |
| 44454.885416666664 | 7.84 |
| 44454.895833333336 | 7.83 |
| 44454.90625 | 7.81 |
| 44454.916666666664 | 7.81 |
| 44454.927083333336 | 7.83 |
| 44454.9375 | 7.85 |
| 44454.947916666664 | 7.84 |
| 44454.958333333336 | 7.82 |
| 44454.96875 | 7.81 |
| 44454.979166666664 | 7.81 |
| 44454.989583333336 | 7.81 |
| 44455.0 | 7.78 |
| 44455.010416666664 | 7.76 |
| 44455.020833333336 | 7.73 |
| 44455.03125 | 7.74 |
| 44455.041666666664 | 7.72 |
| 44455.052083333336 | 7.71 |
| 44455.0625 | 7.71 |
| 44455.072916666664 | 7.69 |
| 44455.083333333336 | 7.67 |
| 44455.09375 | 7.66 |
| 44455.104166666664 | 7.64 |
| 44455.114583333336 | 7.64 |
| 44455.125 | 7.63 |
| 44455.135416666664 | 7.63 |
| 44455.145833333336 | 7.62 |
| 44455.15625 | 7.26 |
| 44455.166666666664 | 7.3 |
| 44455.177083333336 | 7.27 |
| 44455.1875 | 7.39 |
| 44455.197916666664 | 7.36 |
| 44455.208333333336 | 7.4 |
| 44455.21875 | 7.48 |
| 44455.229166666664 | 7.51 |
| 44455.239583333336 | 7.52 |
| 44455.25 | 7.52 |
| 44455.260416666664 | 7.54 |
| 44455.270833333336 | 7.55 |
| 44455.28125 | 7.54 |
| 44455.291666666664 | 7.57 |
| 44455.302083333336 | 7.57 |
| 44455.3125 | 7.56 |
| 44455.322916666664 | 7.6 |
| 44455.333333333336 | 7.6 |
| 44455.34375 | 7.58 |
| 44455.354166666664 | 7.57 |
| 44455.364583333336 | 7.54 |
| 44455.375 | 7.56 |
| 44455.385416666664 | 7.51 |
| 44455.395833333336 | 7.46 |
| 44455.40625 | 7.49 |
| 44455.416666666664 | 7.51 |
| 44455.427083333336 | 7.57 |
| 44455.4375 | 7.53 |
| 44455.447916666664 | 7.63 |
| 44455.458333333336 | 7.66 |
| 44455.46875 | 7.64 |
| 44455.479166666664 | 7.63 |
| 44455.489583333336 | 7.63 |
| 44455.5 | 7.61 |
| 44455.510416666664 | 7.58 |
| 44455.520833333336 | 7.55 |
| 44455.53125 | 7.55 |
| 44455.541666666664 | 7.57 |
| 44455.552083333336 | 7.55 |
| 44455.5625 | 7.53 |
| 44455.572916666664 | 7.51 |
| 44455.583333333336 | 7.51 |
| 44455.59375 | 7.5 |
| 44455.604166666664 | 7.5 |
| 44455.614583333336 | 7.5 |
| 44455.625 | 7.49 |
| 44455.635416666664 | 7.49 |
| 44455.645833333336 | 7.5 |
| 44455.65625 | 7.5 |
| 44455.666666666664 | 7.5 |
| 44455.677083333336 | 7.5 |
| 44455.6875 | 7.5 |
| 44455.697916666664 | 7.51 |
| 44455.708333333336 | 7.54 |
| 44455.71875 | 7.56 |
| 44455.729166666664 | 7.63 |
| 44455.739583333336 | 7.68 |
| 44455.75 | 7.72 |
| 44455.760416666664 | 7.74 |
| 44455.770833333336 | 7.76 |
| 44455.78125 | 7.79 |
| 44455.791666666664 | 7.82 |
| 44455.802083333336 | 7.85 |
| 44455.8125 | 7.86 |
| 44455.822916666664 | 7.89 |
| 44455.833333333336 | 7.88 |
| 44455.84375 | 7.89 |
| 44455.854166666664 | 7.89 |
| 44455.864583333336 | 7.88 |
| 44455.875 | 7.88 |
| 44455.885416666664 | 7.87 |
| 44455.895833333336 | 7.87 |
| 44455.90625 | 7.87 |
| 44455.916666666664 | 7.86 |
| 44455.927083333336 | 7.84 |
| 44455.9375 | 7.78 |
| 44455.947916666664 | 7.83 |
| 44455.958333333336 | 7.82 |
| 44455.96875 | 7.84 |
| 44455.979166666664 | 7.83 |
| 44455.989583333336 | 7.83 |
| 44456.0 | 7.81 |
| 44456.010416666664 | 7.81 |
| 44456.020833333336 | 7.8 |
| 44456.03125 | 7.77 |
| 44456.041666666664 | 7.73 |
| 44456.052083333336 | 7.7 |
| 44456.0625 | 7.66 |
| 44456.072916666664 | 7.64 |
| 44456.083333333336 | 7.64 |
| 44456.09375 | 7.62 |
| 44456.104166666664 | 7.62 |
| 44456.114583333336 | 7.61 |
| 44456.125 | 7.62 |
| 44456.135416666664 | 7.61 |
| 44456.145833333336 | 7.6 |
| 44456.15625 | 7.58 |
| 44456.166666666664 | 7.58 |
| 44456.177083333336 | 7.57 |
| 44456.1875 | 7.57 |
| 44456.197916666664 | 7.36 |
| 44456.208333333336 | 7.32 |
| 44456.21875 | 7.35 |
| 44456.229166666664 | 7.41 |
| 44456.239583333336 | 7.43 |
| 44456.25 | 7.44 |
| 44456.260416666664 | 7.45 |
| 44456.270833333336 | 7.47 |
| 44456.28125 | 7.51 |
| 44456.291666666664 | 7.52 |
| 44456.302083333336 | 7.56 |
| 44456.3125 | 7.57 |
| 44456.322916666664 | 7.58 |
| 44456.333333333336 | 7.58 |
| 44456.34375 | 7.6 |
| 44456.354166666664 | 7.61 |
| 44456.364583333336 | 7.62 |
| 44456.375 | 7.62 |
| 44456.385416666664 | 7.63 |
| 44456.395833333336 | 7.61 |
| 44456.40625 | 7.61 |
| 44456.416666666664 | 7.6 |
| 44456.427083333336 | 7.58 |
| 44456.4375 | 7.57 |
| 44456.447916666664 | 7.63 |
| 44456.458333333336 | 7.65 |
| 44456.46875 | 7.64 |
| 44456.479166666664 | 7.62 |
| 44456.489583333336 | 7.61 |
| 44456.5 | 7.61 |
| 44456.510416666664 | 7.6 |
| 44456.520833333336 | 7.59 |
| 44456.53125 | 7.56 |
| 44456.541666666664 | 7.54 |
| 44456.552083333336 | 7.52 |
| 44456.5625 | 7.52 |
| 44456.572916666664 | 7.5 |
| 44456.583333333336 | 7.49 |
| 44456.59375 | 7.48 |
| 44456.604166666664 | 7.49 |
| 44456.614583333336 | 7.53 |
| 44456.625 | 7.54 |
| 44456.635416666664 | 7.56 |
| 44456.645833333336 | 7.57 |
| 44456.65625 | 7.57 |
| 44456.666666666664 | 7.58 |
| 44456.677083333336 | 7.58 |
| 44456.6875 | 7.59 |
| 44456.697916666664 | 7.59 |
| 44456.708333333336 | 7.58 |
| 44456.71875 | 7.58 |
| 44456.729166666664 | 7.6 |
| 44456.739583333336 | 7.6 |
| 44456.75 | 7.61 |
| 44456.760416666664 | 7.62 |
| 44456.770833333336 | 7.63 |
| 44456.78125 | 7.66 |
| 44456.791666666664 | 7.68 |
| 44456.802083333336 | 7.75 |
| 44456.8125 | 7.79 |
| 44456.822916666664 | 7.8 |
| 44456.833333333336 | 7.81 |
| 44456.84375 | 7.84 |
| 44456.854166666664 | 7.87 |
| 44456.864583333336 | 7.89 |
| 44456.875 | 7.9 |
| 44456.885416666664 | 7.9 |
| 44456.895833333336 | 7.9 |
| 44456.90625 | 7.89 |
| 44456.916666666664 | 7.89 |
| 44456.927083333336 | 7.89 |
| 44456.9375 | 7.89 |
| 44456.947916666664 | 7.88 |
| 44456.958333333336 | 7.88 |
| 44456.96875 | 7.83 |
| 44456.979166666664 | 7.85 |
| 44456.989583333336 | 7.78 |
| 44457.0 | 7.8 |
| 44457.010416666664 | 7.75 |
| 44457.020833333336 | 7.79 |
| 44457.03125 | 7.81 |
| 44457.041666666664 | 7.79 |
| 44457.052083333336 | 7.7 |
| 44457.0625 | 7.62 |
| 44457.072916666664 | 7.64 |
| 44457.083333333336 | 7.72 |
| 44457.09375 | 7.61 |
| 44457.104166666664 | 7.66 |
| 44457.114583333336 | 7.55 |
| 44457.125 | 7.58 |
| 44457.135416666664 | 7.5 |
| 44457.145833333336 | 7.41 |
| 44457.15625 | 7.54 |
| 44457.166666666664 | 7.56 |
| 44457.177083333336 | 7.56 |
| 44457.1875 | 7.62 |
| 44457.197916666664 | 7.48 |
| 44457.208333333336 | 7.41 |
| 44457.21875 | 7.65 |
| 44457.229166666664 | 7.64 |
| 44457.239583333336 | 7.62 |
| 44457.25 | 7.43 |
| 44457.260416666664 | 7.34 |
| 44457.270833333336 | 7.47 |
| 44457.28125 | 7.53 |
| 44457.291666666664 | 7.55 |
| 44457.302083333336 | 7.56 |
| 44457.3125 | 7.56 |
| 44457.322916666664 | 7.6 |
| 44457.333333333336 | 7.62 |
| 44457.34375 | 7.63 |
| 44457.354166666664 | 7.63 |
| 44457.364583333336 | 7.63 |
| 44457.375 | 7.61 |
| 44457.385416666664 | 7.64 |
| 44457.395833333336 | 7.63 |
| 44457.40625 | 7.61 |
| 44457.416666666664 | 7.62 |
| 44457.427083333336 | 7.61 |
| 44457.4375 | 7.6 |
| 44457.447916666664 | 7.66 |
| 44457.458333333336 | 7.68 |
| 44457.46875 | 7.67 |
| 44457.479166666664 | 7.53 |
| 44457.489583333336 | 7.5 |
| 44457.5 | 7.53 |
| 44457.510416666664 | 7.53 |
| 44457.520833333336 | 7.54 |
| 44457.53125 | 7.56 |
| 44457.541666666664 | 7.51 |
| 44457.552083333336 | 7.6 |
| 44457.5625 | 7.58 |
| 44457.572916666664 | 7.52 |
| 44457.583333333336 | 7.51 |
| 44457.59375 | 7.49 |
| 44457.604166666664 | 7.51 |
| 44457.614583333336 | 7.48 |
| 44457.625 | 7.52 |
| 44457.635416666664 | 7.53 |
| 44457.645833333336 | 7.57 |
| 44457.65625 | 7.56 |
| 44457.666666666664 | 7.57 |
| 44457.677083333336 | 7.59 |
| 44457.6875 | 7.58 |
| 44457.697916666664 | 7.59 |
| 44457.708333333336 | 7.58 |
| 44457.71875 | 7.58 |
| 44457.729166666664 | 7.58 |
| 44457.739583333336 | 7.6 |
| 44457.75 | 7.58 |
| 44457.760416666664 | 7.58 |
| 44457.770833333336 | 7.58 |
| 44457.78125 | 7.59 |
| 44457.791666666664 | 7.59 |
| 44457.802083333336 | 7.62 |
| 44457.8125 | 7.66 |
| 44457.822916666664 | 7.69 |
| 44457.833333333336 | 7.71 |
| 44457.84375 | 7.73 |
| 44457.854166666664 | 7.76 |
| 44457.864583333336 | 7.79 |
| 44457.875 | 7.82 |
| 44457.885416666664 | 7.83 |
| 44457.895833333336 | 7.84 |
| 44457.90625 | 7.86 |
| 44457.916666666664 | 7.86 |
| 44457.927083333336 | 7.87 |
| 44457.9375 | 7.87 |
| 44457.947916666664 | 7.86 |
| 44457.958333333336 | 7.85 |
| 44457.96875 | 7.84 |
| 44457.979166666664 | 7.81 |
| 44457.989583333336 | 7.78 |
| 44458.0 | 7.77 |
| 44458.010416666664 | 7.76 |
| 44458.020833333336 | 7.77 |
| 44458.03125 | 7.79 |
| 44458.041666666664 | 7.8 |
| 44458.052083333336 | 7.79 |
| 44458.0625 | 7.78 |
| 44458.072916666664 | 7.78 |
| 44458.083333333336 | 7.77 |
| 44458.09375 | 7.75 |
| 44458.104166666664 | 7.72 |
| 44458.114583333336 | 7.7 |
| 44458.125 | 7.68 |
| 44458.135416666664 | 7.65 |
| 44458.145833333336 | 7.6 |
| 44458.15625 | 7.57 |
| 44458.166666666664 | 7.57 |
| 44458.177083333336 | 7.53 |
| 44458.1875 | 7.56 |
| 44458.197916666664 | 7.57 |
| 44458.208333333336 | 7.57 |
| 44458.21875 | 7.57 |
| 44458.229166666664 | 7.57 |
| 44458.239583333336 | 7.56 |
| 44458.25 | 7.55 |
| 44458.260416666664 | 7.54 |
| 44458.270833333336 | 7.53 |
| 44458.28125 | 7.5 |
| 44458.291666666664 | 7.4 |
| 44458.302083333336 | 7.47 |
| 44458.3125 | 7.5 |
| 44458.322916666664 | 7.5 |
| 44458.333333333336 | 7.53 |
| 44458.34375 | 7.54 |
| 44458.354166666664 | 7.58 |
| 44458.364583333336 | 7.59 |
| 44458.375 | 7.59 |
| 44458.385416666664 | 7.6 |
| 44458.395833333336 | 7.61 |
| 44458.40625 | 7.61 |
| 44458.416666666664 | 7.62 |
| 44458.427083333336 | 7.62 |
| 44458.4375 | 7.62 |
| 44458.447916666664 | 7.63 |
| 44458.458333333336 | 7.63 |
| 44458.46875 | 7.65 |
| 44458.479166666664 | 7.65 |
| 44458.489583333336 | 7.66 |
| 44458.5 | 7.65 |
| 44458.510416666664 | 7.62 |
| 44458.520833333336 | 7.62 |
| 44458.53125 | 7.63 |
| 44458.541666666664 | 7.65 |
| 44458.552083333336 | 7.66 |
| 44458.5625 | 7.64 |
| 44458.572916666664 | 7.61 |
| 44458.583333333336 | 7.61 |
| 44458.59375 | 7.59 |
| 44458.604166666664 | 7.6 |
| 44458.614583333336 | 7.59 |
| 44458.625 | 7.58 |
| 44458.635416666664 | 7.58 |
| 44458.645833333336 | 7.58 |
| 44458.65625 | 7.6 |
| 44458.666666666664 | 7.61 |
| 44458.677083333336 | 7.62 |
| 44458.6875 | 7.63 |
| 44458.697916666664 | 7.63 |
| 44458.708333333336 | 7.63 |
| 44458.71875 | 7.63 |
| 44458.729166666664 | 7.64 |
| 44458.739583333336 | 7.64 |
| 44458.75 | 7.64 |
| 44458.760416666664 | 7.65 |
| 44458.770833333336 | 7.63 |
| 44458.78125 | 7.63 |
| 44458.791666666664 | 7.62 |
| 44458.802083333336 | 7.61 |
| 44458.8125 | 7.61 |
| 44458.822916666664 | 7.62 |
| 44458.833333333336 | 7.65 |
| 44458.84375 | 7.68 |
| 44458.854166666664 | 7.72 |
| 44458.864583333336 | 7.78 |
| 44458.875 | 7.79 |
| 44458.885416666664 | 7.82 |
| 44458.895833333336 | 7.84 |
| 44458.90625 | 7.89 |
| 44458.916666666664 | 7.9 |
| 44458.927083333336 | 7.9 |
| 44458.9375 | 7.91 |
| 44458.947916666664 | 7.91 |
| 44458.958333333336 | 7.9 |
| 44458.96875 | 7.88 |
| 44458.979166666664 | 7.88 |
| 44458.989583333336 | 7.87 |
| 44459.0 | 7.86 |
| 44459.010416666664 | 7.85 |
| 44459.020833333336 | 7.84 |
| 44459.03125 | 7.83 |
| 44459.041666666664 | 7.81 |
| 44459.052083333336 | 7.8 |
| 44459.0625 | 7.8 |
| 44459.072916666664 | 7.83 |
| 44459.083333333336 | 7.83 |
| 44459.09375 | 7.83 |
| 44459.104166666664 | 7.82 |
| 44459.114583333336 | 7.81 |
| 44459.125 | 7.8 |
| 44459.135416666664 | 7.77 |
| 44459.145833333336 | 7.76 |
| 44459.15625 | 7.76 |
| 44459.166666666664 | 7.73 |
| 44459.177083333336 | 7.74 |
| 44459.1875 | 7.7 |
| 44459.197916666664 | 7.72 |
| 44459.208333333336 | 7.71 |
| 44459.21875 | 7.7 |
| 44459.229166666664 | 7.67 |
| 44459.239583333336 | 7.66 |
| 44459.25 | 7.64 |
| 44459.260416666664 | 7.62 |
| 44459.270833333336 | 7.61 |
| 44459.28125 | 7.58 |
| 44459.291666666664 | 7.57 |
| 44459.302083333336 | 7.56 |
| 44459.3125 | 7.52 |
| 44459.322916666664 | 7.53 |
| 44459.333333333336 | 7.55 |
| 44459.34375 | 7.57 |
| 44459.354166666664 | 7.59 |
| 44459.364583333336 | 7.6 |
| 44459.375 | 7.63 |
| 44459.385416666664 | 7.63 |
| 44459.395833333336 | 7.65 |
| 44459.40625 | 7.65 |
| 44459.416666666664 | 7.66 |
| 44459.427083333336 | 7.67 |
| 44459.4375 | 7.67 |
| 44459.447916666664 | 7.67 |
| 44459.458333333336 | 7.68 |
| 44459.46875 | 7.68 |
| 44459.479166666664 | 7.68 |
| 44459.489583333336 | 7.69 |
| 44459.5 | 7.69 |
| 44459.510416666664 | 7.7 |
| 44459.520833333336 | 7.7 |
| 44459.53125 | 7.69 |
| 44459.541666666664 | 7.71 |
| 44459.552083333336 | 7.71 |
| 44459.5625 | 7.67 |
| 44459.572916666664 | 7.72 |
| 44459.583333333336 | 7.73 |
| 44459.59375 | 7.73 |
| 44459.604166666664 | 7.72 |
| 44459.614583333336 | 7.7 |
| 44459.625 | 7.69 |
| 44459.635416666664 | 7.69 |
| 44459.645833333336 | 7.68 |
| 44459.65625 | 7.67 |
| 44459.666666666664 | 7.67 |
| 44459.677083333336 | 7.68 |
| 44459.6875 | 7.68 |
| 44459.697916666664 | 7.7 |
| 44459.708333333336 | 7.7 |
| 44459.71875 | 7.71 |
| 44459.729166666664 | 7.72 |
| 44459.739583333336 | 7.73 |
| 44459.75 | 7.73 |
| 44459.760416666664 | 7.72 |
| 44459.770833333336 | 7.72 |
| 44459.78125 | 7.71 |
| 44459.791666666664 | 7.71 |
| 44459.802083333336 | 7.7 |
| 44459.8125 | 7.69 |
| 44459.822916666664 | 7.69 |
| 44459.833333333336 | 7.68 |
| 44459.84375 | 7.68 |
| 44459.854166666664 | 7.68 |
| 44459.864583333336 | 7.7 |
| 44459.875 | 7.7 |
| 44459.885416666664 | 7.72 |
| 44459.895833333336 | 7.79 |
| 44459.90625 | 7.81 |
| 44459.916666666664 | 7.8 |
| 44459.927083333336 | 7.82 |
| 44459.9375 | 7.84 |
| 44459.947916666664 | 7.87 |
| 44459.958333333336 | 7.88 |
| 44459.96875 | 7.88 |
| 44459.979166666664 | 7.89 |
| 44459.989583333336 | 7.88 |
| 44460.0 | 7.87 |
| 44460.010416666664 | 7.86 |
| 44460.020833333336 | 7.85 |
| 44460.03125 | 7.84 |
| 44460.041666666664 | 7.84 |
| 44460.052083333336 | 7.83 |
| 44460.0625 | 7.83 |
| 44460.072916666664 | 7.78 |
| 44460.083333333336 | 7.82 |
| 44460.09375 | 7.83 |
| 44460.104166666664 | 7.84 |
| 44460.114583333336 | 7.83 |
| 44460.125 | 7.83 |
| 44460.135416666664 | 7.82 |
| 44460.145833333336 | 7.82 |
| 44460.15625 | 7.8 |
| 44460.166666666664 | 7.78 |
| 44460.177083333336 | 7.76 |
| 44460.1875 | 7.74 |
| 44460.197916666664 | 7.76 |
| 44460.208333333336 | 7.75 |
| 44460.21875 | 7.74 |
| 44460.229166666664 | 7.72 |
| 44460.239583333336 | 7.7 |
| 44460.25 | 7.69 |
| 44460.260416666664 | 7.71 |
| 44460.270833333336 | 7.69 |
| 44460.28125 | 7.68 |
| 44460.291666666664 | 7.68 |
| 44460.302083333336 | 7.67 |
| 44460.3125 | 7.66 |
| 44460.322916666664 | 7.66 |
| 44460.333333333336 | 7.64 |
| 44460.34375 | 7.64 |
| 44460.354166666664 | 7.56 |
| 44460.364583333336 | 7.63 |
| 44460.375 | 7.64 |
| 44460.385416666664 | 7.64 |
| 44460.395833333336 | 7.64 |
| 44460.40625 | 7.66 |
| 44460.416666666664 | 7.67 |
| 44460.427083333336 | 7.67 |
| 44460.4375 | 7.67 |
| 44460.447916666664 | 7.68 |
| 44460.458333333336 | 7.7 |
| 44460.46875 | 7.7 |
| 44460.479166666664 | 7.7 |
| 44460.489583333336 | 7.7 |
| 44460.5 | 7.71 |
| 44460.510416666664 | 7.71 |
| 44460.520833333336 | 7.72 |
| 44460.53125 | 7.73 |
| 44460.541666666664 | 7.74 |
| 44460.552083333336 | 7.75 |
| 44460.5625 | 7.76 |
| 44460.572916666664 | 7.76 |
| 44460.583333333336 | 7.76 |
| 44460.59375 | 7.76 |
| 44460.604166666664 | 7.77 |
| 44460.614583333336 | 7.77 |
| 44460.625 | 7.77 |
| 44460.635416666664 | 7.75 |
| 44460.645833333336 | 7.75 |
| 44460.65625 | 7.74 |
| 44460.666666666664 | 7.73 |
| 44460.677083333336 | 7.73 |
| 44460.6875 | 7.73 |
| 44460.697916666664 | 7.73 |
| 44460.708333333336 | 7.75 |
| 44460.71875 | 7.75 |
| 44460.729166666664 | 7.76 |
| 44460.739583333336 | 7.76 |
| 44460.75 | 7.77 |
| 44460.760416666664 | 7.77 |
| 44460.770833333336 | 7.78 |
| 44460.78125 | 7.78 |
| 44460.791666666664 | 7.78 |
| 44460.802083333336 | 7.78 |
| 44460.8125 | 7.78 |
| 44460.822916666664 | 7.77 |
| 44460.833333333336 | 7.78 |
| 44460.84375 | 7.77 |
| 44460.854166666664 | 7.75 |
| 44460.864583333336 | 7.75 |
| 44460.875 | 7.75 |
| 44460.885416666664 | 7.74 |
| 44460.895833333336 | 7.74 |
| 44460.90625 | 7.75 |
| 44460.916666666664 | 7.78 |
| 44460.927083333336 | 7.82 |
| 44460.9375 | 7.82 |
| 44460.947916666664 | 7.82 |
| 44460.958333333336 | 7.84 |
| 44460.96875 | 7.87 |
| 44460.979166666664 | 7.88 |
| 44460.989583333336 | 7.87 |
| 44461.0 | 7.86 |
| 44461.010416666664 | 7.86 |
| 44461.020833333336 | 7.85 |
| 44461.03125 | 7.84 |
| 44461.041666666664 | 7.83 |
| 44461.052083333336 | 7.82 |
| 44461.0625 | 7.8 |
| 44461.072916666664 | 7.8 |
| 44461.083333333336 | 7.78 |
| 44461.09375 | 7.77 |
| 44461.104166666664 | 7.77 |
| 44461.114583333336 | 7.77 |
| 44461.125 | 7.82 |
| 44461.135416666664 | 7.8 |
| 44461.145833333336 | 7.83 |
| 44461.15625 | 7.81 |
| 44461.166666666664 | 7.79 |
| 44461.177083333336 | 7.78 |
| 44461.1875 | 7.78 |
| 44461.197916666664 | 7.76 |
| 44461.208333333336 | 7.72 |
| 44461.21875 | 7.71 |
| 44461.229166666664 | 7.7 |
| 44461.239583333336 | 7.69 |
| 44461.25 | 7.7 |
| 44461.260416666664 | 7.7 |
| 44461.270833333336 | 7.7 |
| 44461.28125 | 7.7 |
| 44461.291666666664 | 7.68 |
| 44461.302083333336 | 7.67 |
| 44461.3125 | 7.67 |
| 44461.322916666664 | 7.66 |
| 44461.333333333336 | 7.66 |
| 44461.34375 | 7.66 |
| 44461.354166666664 | 7.63 |
| 44461.364583333336 | 7.45 |
| 44461.375 | 7.53 |
| 44461.385416666664 | 7.59 |
| 44461.395833333336 | 7.6 |
| 44461.40625 | 7.63 |
| 44461.416666666664 | 7.63 |
| 44461.427083333336 | 7.67 |
| 44461.4375 | 7.66 |
| 44461.447916666664 | 7.66 |
| 44461.458333333336 | 7.66 |
| 44461.46875 | 7.67 |
| 44461.479166666664 | 7.68 |
| 44461.489583333336 | 7.67 |
| 44461.5 | 7.68 |
| 44461.510416666664 | 7.68 |
| 44461.520833333336 | 7.69 |
| 44461.53125 | 7.7 |
| 44461.541666666664 | 7.7 |
| 44461.552083333336 | 7.72 |
| 44461.5625 | 7.72 |
| 44461.572916666664 | 7.74 |
| 44461.583333333336 | 7.75 |
| 44461.59375 | 7.64 |
| 44461.604166666664 | 7.7 |
| 44461.614583333336 | 7.72 |
| 44461.625 | 7.73 |
| 44461.635416666664 | 7.74 |
| 44461.645833333336 | 7.74 |
| 44461.65625 | 7.74 |
| 44461.666666666664 | 7.74 |
| 44461.677083333336 | 7.73 |
| 44461.6875 | 7.72 |
| 44461.697916666664 | 7.72 |
| 44461.708333333336 | 7.71 |
| 44461.71875 | 7.71 |
| 44461.729166666664 | 7.71 |
| 44461.739583333336 | 7.71 |
| 44461.75 | 7.71 |
| 44461.760416666664 | 7.72 |
| 44461.770833333336 | 7.72 |
| 44461.78125 | 7.73 |
| 44461.791666666664 | 7.74 |
| 44461.802083333336 | 7.75 |
| 44461.8125 | 7.76 |
| 44461.822916666664 | 7.76 |
| 44461.833333333336 | 7.76 |
| 44461.84375 | 7.76 |
| 44461.854166666664 | 7.76 |
| 44461.864583333336 | 7.76 |
| 44461.875 | 7.74 |
| 44461.885416666664 | 7.72 |
| 44461.895833333336 | 7.71 |
| 44461.90625 | 7.7 |
| 44461.916666666664 | 7.7 |
| 44461.927083333336 | 7.71 |
| 44461.9375 | 7.7 |
| 44461.947916666664 | 7.7 |
| 44461.958333333336 | 7.69 |
| 44461.96875 | 7.69 |
| 44461.979166666664 | 7.7 |
| 44461.989583333336 | 7.7 |
| 44462.0 | 7.72 |
| 44462.010416666664 | 7.7 |
| 44462.020833333336 | 7.71 |
| 44462.03125 | 7.73 |
| 44462.041666666664 | 7.73 |
| 44462.052083333336 | 7.76 |
| 44462.0625 | 7.75 |
| 44462.072916666664 | 7.79 |
| 44462.083333333336 | 7.77 |
| 44462.09375 | 7.79 |
| 44462.104166666664 | 7.76 |
| 44462.114583333336 | 7.81 |
| 44462.125 | 7.77 |
| 44462.135416666664 | 7.79 |
| 44462.145833333336 | 7.74 |
| 44462.15625 | 7.74 |
| 44462.166666666664 | 7.79 |
| 44462.177083333336 | 7.79 |
| 44462.1875 | 7.76 |
| 44462.197916666664 | 7.72 |
| 44462.208333333336 | 7.72 |
| 44462.21875 | 7.68 |
| 44462.229166666664 | 7.69 |
| 44462.239583333336 | 7.66 |
| 44462.25 | 7.68 |
| 44462.260416666664 | 7.67 |
| 44462.270833333336 | 7.66 |
| 44462.28125 | 7.66 |
| 44462.291666666664 | 7.67 |
| 44462.302083333336 | 7.67 |
| 44462.3125 | 7.66 |
| 44462.322916666664 | 7.66 |
| 44462.333333333336 | 7.66 |
| 44462.34375 | 7.65 |
| 44462.354166666664 | 7.65 |
| 44462.364583333336 | 7.65 |
| 44462.375 | 7.45 |
| 44462.385416666664 | 7.52 |
| 44462.395833333336 | 7.56 |
| 44462.40625 | 7.58 |
| 44462.416666666664 | 7.61 |
| 44462.427083333336 | 7.6 |
| 44462.4375 | 7.62 |
| 44462.447916666664 | 7.6 |
| 44462.458333333336 | 7.62 |
| 44462.46875 | 7.63 |
| 44462.479166666664 | 7.61 |
| 44462.489583333336 | 7.63 |
| 44462.5 | 7.65 |
| 44462.510416666664 | 7.68 |
| 44462.520833333336 | 7.69 |
| 44462.53125 | 7.68 |
| 44462.541666666664 | 7.69 |
| 44462.552083333336 | 7.7 |
| 44462.5625 | 7.7 |
| 44462.572916666664 | 7.7 |
| 44462.583333333336 | 7.71 |
| 44462.59375 | 7.71 |
| 44462.604166666664 | 7.7 |
| 44462.614583333336 | 7.71 |
| 44462.625 | 7.7 |
| 44462.635416666664 | 7.72 |
| 44462.645833333336 | 7.71 |
| 44462.65625 | 7.69 |
| 44462.666666666664 | 7.68 |
| 44462.677083333336 | 7.72 |
| 44462.6875 | 7.71 |
| 44462.697916666664 | 7.69 |
| 44462.708333333336 | 7.68 |
| 44462.71875 | 7.67 |
| 44462.729166666664 | 7.66 |
| 44462.739583333336 | 7.66 |
| 44462.75 | 7.65 |
| 44462.760416666664 | 7.63 |
| 44462.770833333336 | 7.62 |
| 44462.78125 | 7.61 |
| 44462.791666666664 | 7.61 |
| 44462.802083333336 | 7.61 |
| 44462.8125 | 7.63 |
| 44462.822916666664 | 7.62 |
| 44462.833333333336 | 7.62 |
| 44462.84375 | 7.61 |
| 44462.854166666664 | 7.6 |
| 44462.864583333336 | 7.59 |
| 44462.875 | 7.56 |
| 44462.885416666664 | 7.55 |
| 44462.895833333336 | 7.55 |
| 44462.90625 | 7.52 |
| 44462.916666666664 | 7.52 |
| 44462.927083333336 | 7.54 |
| 44462.9375 | 7.55 |
| 44462.947916666664 | 7.55 |
| 44462.958333333336 | 7.57 |
| 44462.96875 | 7.58 |
| 44462.979166666664 | 7.58 |
| 44462.989583333336 | 7.59 |
| 44463.0 | 7.58 |
| 44463.010416666664 | 7.59 |
| 44463.020833333336 | 7.59 |
| 44463.03125 | 7.58 |
| 44463.041666666664 | 7.58 |
| 44463.052083333336 | 7.58 |
| 44463.0625 | 7.57 |
| 44463.072916666664 | 7.58 |
| 44463.083333333336 | 7.58 |
| 44463.09375 | 7.59 |
| 44463.104166666664 | 7.6 |
| 44463.114583333336 | 7.58 |
| 44463.125 | 7.57 |
| 44463.135416666664 | 7.59 |
| 44463.145833333336 | 7.59 |
| 44463.15625 | 7.57 |
| 44463.166666666664 | 7.57 |
| 44463.177083333336 | 7.6 |
| 44463.1875 | 7.57 |
| 44463.197916666664 | 7.61 |
| 44463.208333333336 | 7.54 |
| 44463.21875 | 7.54 |
| 44463.229166666664 | 7.52 |
| 44463.239583333336 | 7.5 |
| 44463.25 | 7.48 |
| 44463.260416666664 | 7.44 |
| 44463.270833333336 | 7.44 |
| 44463.28125 | 7.43 |
| 44463.291666666664 | 7.44 |
| 44463.302083333336 | 7.43 |
| 44463.3125 | 7.45 |
| 44463.322916666664 | 7.47 |
| 44463.333333333336 | 7.48 |
| 44463.34375 | 7.49 |
| 44463.354166666664 | 7.5 |
| 44463.364583333336 | 7.49 |
| 44463.375 | 7.5 |
| 44463.385416666664 | 7.5 |
| 44463.395833333336 | 7.5 |
| 44463.40625 | 7.3 |
| 44463.416666666664 | 7.27 |
| 44463.427083333336 | 7.34 |
| 44463.4375 | 7.41 |
| 44463.447916666664 | 7.46 |
| 44463.458333333336 | 7.49 |
| 44463.46875 | 7.5 |
| 44463.479166666664 | 7.53 |
| 44463.489583333336 | 7.55 |
| 44463.5 | 7.55 |
| 44463.510416666664 | 7.56 |
| 44463.520833333336 | 7.56 |
| 44463.53125 | 7.56 |
| 44463.541666666664 | 7.58 |
| 44463.552083333336 | 7.58 |
| 44463.5625 | 7.59 |
| 44463.572916666664 | 7.6 |
| 44463.583333333336 | 7.62 |
| 44463.59375 | 7.63 |
| 44463.604166666664 | 7.64 |
| 44463.614583333336 | 7.65 |
| 44463.625 | 7.66 |
| 44463.635416666664 | 7.67 |
| 44463.645833333336 | 7.68 |
| 44463.65625 | 7.67 |
| 44463.666666666664 | 7.68 |
| 44463.677083333336 | 7.68 |
| 44463.6875 | 7.68 |
| 44463.697916666664 | 7.67 |
| 44463.708333333336 | 7.67 |
| 44463.71875 | 7.66 |
| 44463.729166666664 | 7.66 |
| 44463.739583333336 | 7.67 |
| 44463.75 | 7.67 |
| 44463.760416666664 | 7.66 |
| 44463.770833333336 | 7.66 |
| 44463.78125 | 7.67 |
| 44463.791666666664 | 7.68 |
| 44463.802083333336 | 7.68 |
| 44463.8125 | 7.68 |
| 44463.822916666664 | 7.69 |
| 44463.833333333336 | 7.7 |
| 44463.84375 | 7.7 |
| 44463.854166666664 | 7.7 |
| 44463.864583333336 | 7.7 |
| 44463.875 | 7.7 |
| 44463.885416666664 | 7.69 |
| 44463.895833333336 | 7.69 |
| 44463.90625 | 7.69 |
| 44463.916666666664 | 7.69 |
| 44463.927083333336 | 7.69 |
| 44463.9375 | 7.64 |
| 44463.947916666664 | 7.6 |
| 44463.958333333336 | 7.56 |
| 44463.96875 | 7.59 |
| 44463.979166666664 | 7.63 |
| 44463.989583333336 | 7.63 |
| 44464.0 | 7.61 |
| 44464.010416666664 | 7.63 |
| 44464.020833333336 | 7.69 |
| 44464.03125 | 7.69 |
| 44464.041666666664 | 7.67 |
| 44464.052083333336 | 7.66 |
| 44464.0625 | 7.65 |
| 44464.072916666664 | 7.63 |
| 44464.083333333336 | 7.63 |
| 44464.09375 | 7.62 |
| 44464.104166666664 | 7.62 |
| 44464.114583333336 | 7.61 |
| 44464.125 | 7.61 |
| 44464.135416666664 | 7.59 |
| 44464.145833333336 | 7.59 |
| 44464.15625 | 7.58 |
| 44464.166666666664 | 7.58 |
| 44464.177083333336 | 7.58 |
| 44464.1875 | 7.61 |
| 44464.197916666664 | 7.61 |
| 44464.208333333336 | 7.61 |
| 44464.21875 | 7.63 |
| 44464.229166666664 | 7.65 |
| 44464.239583333336 | 7.62 |
| 44464.25 | 7.63 |
| 44464.260416666664 | 7.64 |
| 44464.270833333336 | 7.59 |
| 44464.28125 | 7.59 |
| 44464.291666666664 | 7.59 |
| 44464.302083333336 | 7.57 |
| 44464.3125 | 7.6 |
| 44464.322916666664 | 7.6 |
| 44464.333333333336 | 7.62 |
| 44464.34375 | 7.6 |
| 44464.354166666664 | 7.61 |
| 44464.364583333336 | 7.6 |
| 44464.375 | 7.6 |
| 44464.385416666664 | 7.6 |
| 44464.395833333336 | 7.6 |
| 44464.40625 | 7.6 |
| 44464.416666666664 | 7.6 |
| 44464.427083333336 | 7.43 |
| 44464.4375 | 7.35 |
| 44464.447916666664 | 7.43 |
| 44464.458333333336 | 7.53 |
| 44464.46875 | 7.56 |
| 44464.479166666664 | 7.57 |
| 44464.489583333336 | 7.56 |
| 44464.5 | 7.58 |
| 44464.510416666664 | 7.61 |
| 44464.520833333336 | 7.61 |
| 44464.53125 | 7.61 |
| 44464.541666666664 | 7.61 |
| 44464.552083333336 | 7.61 |
| 44464.5625 | 7.61 |
| 44464.572916666664 | 7.61 |
| 44464.583333333336 | 7.61 |
| 44464.59375 | 7.61 |
| 44464.604166666664 | 7.62 |
| 44464.614583333336 | 7.64 |
| 44464.625 | 7.67 |
| 44464.635416666664 | 7.68 |
| 44464.645833333336 | 7.69 |
| 44464.65625 | 7.71 |
| 44464.666666666664 | 7.72 |
| 44464.677083333336 | 7.73 |
| 44464.6875 | 7.73 |
| 44464.697916666664 | 7.74 |
| 44464.708333333336 | 7.73 |
| 44464.71875 | 7.74 |
| 44464.729166666664 | 7.72 |
| 44464.739583333336 | 7.71 |
| 44464.75 | 7.7 |
| 44464.760416666664 | 7.7 |
| 44464.770833333336 | 7.69 |
| 44464.78125 | 7.7 |
| 44464.791666666664 | 7.7 |
| 44464.802083333336 | 7.7 |
| 44464.8125 | 7.71 |
| 44464.822916666664 | 7.71 |
| 44464.833333333336 | 7.72 |
| 44464.84375 | 7.72 |
| 44464.854166666664 | 7.73 |
| 44464.864583333336 | 7.73 |
| 44464.875 | 7.72 |
| 44464.885416666664 | 7.73 |
| 44464.895833333336 | 7.73 |
| 44464.90625 | 7.73 |
| 44464.916666666664 | 7.72 |
| 44464.927083333336 | 7.73 |
| 44464.9375 | 7.73 |
| 44464.947916666664 | 7.73 |
| 44464.958333333336 | 7.68 |
| 44464.96875 | 7.62 |
| 44464.979166666664 | 7.64 |
| 44464.989583333336 | 7.66 |
| 44465.0 | 7.63 |
| 44465.010416666664 | 7.62 |
| 44465.020833333336 | 7.61 |
| 44465.03125 | 7.58 |
| 44465.041666666664 | 7.64 |
| 44465.052083333336 | 7.67 |
| 44465.0625 | 7.7 |
| 44465.072916666664 | 7.68 |
| 44465.083333333336 | 7.66 |
| 44465.09375 | 7.65 |
| 44465.104166666664 | 7.65 |
| 44465.114583333336 | 7.65 |
| 44465.125 | 7.64 |
| 44465.135416666664 | 7.65 |
| 44465.145833333336 | 7.66 |
| 44465.15625 | 7.63 |
| 44465.166666666664 | 7.63 |
| 44465.177083333336 | 7.64 |
| 44465.1875 | 7.63 |
| 44465.197916666664 | 7.61 |
| 44465.208333333336 | 7.61 |
| 44465.21875 | 7.64 |
| 44465.229166666664 | 7.67 |
| 44465.239583333336 | 7.64 |
| 44465.25 | 7.66 |
| 44465.260416666664 | 7.65 |
| 44465.270833333336 | 7.63 |
| 44465.28125 | 7.68 |
| 44465.291666666664 | 7.64 |
| 44465.302083333336 | 7.63 |
| 44465.3125 | 7.64 |
| 44465.322916666664 | 7.67 |
| 44465.333333333336 | 7.66 |
| 44465.34375 | 7.66 |
| 44465.354166666664 | 7.65 |
| 44465.364583333336 | 7.63 |
| 44465.375 | 7.63 |
| 44465.385416666664 | 7.63 |
| 44465.395833333336 | 7.63 |
| 44465.40625 | 7.64 |
| 44465.416666666664 | 7.64 |
| 44465.427083333336 | 7.64 |
| 44465.4375 | 7.64 |
| 44465.447916666664 | 7.61 |
| 44465.458333333336 | 7.56 |
| 44465.46875 | 7.43 |
| 44465.479166666664 | 7.5 |
| 44465.489583333336 | 7.58 |
| 44465.5 | 7.59 |
| 44465.510416666664 | 7.6 |
| 44465.520833333336 | 7.59 |
| 44465.53125 | 7.61 |
| 44465.541666666664 | 7.63 |
| 44465.552083333336 | 7.65 |
| 44465.5625 | 7.66 |
| 44465.572916666664 | 7.66 |
| 44465.583333333336 | 7.66 |
| 44465.59375 | 7.66 |
| 44465.604166666664 | 7.66 |
| 44465.614583333336 | 7.67 |
| 44465.625 | 7.67 |
| 44465.635416666664 | 7.68 |
| 44465.645833333336 | 7.69 |
| 44465.65625 | 7.7 |
| 44465.666666666664 | 7.72 |
| 44465.677083333336 | 7.74 |
| 44465.6875 | 7.74 |
| 44465.697916666664 | 7.76 |
| 44465.708333333336 | 7.77 |
| 44465.71875 | 7.78 |
| 44465.729166666664 | 7.69 |
| 44465.739583333336 | 7.76 |
| 44465.75 | 7.75 |
| 44465.760416666664 | 7.75 |
| 44465.770833333336 | 7.77 |
| 44465.78125 | 7.77 |
| 44465.791666666664 | 7.77 |
| 44465.802083333336 | 7.77 |
| 44465.8125 | 7.78 |
| 44465.822916666664 | 7.78 |
| 44465.833333333336 | 7.78 |
| 44465.84375 | 7.79 |
| 44465.854166666664 | 7.79 |
| 44465.864583333336 | 7.78 |
| 44465.875 | 7.79 |
| 44465.885416666664 | 7.79 |
| 44465.895833333336 | 7.79 |
| 44465.90625 | 7.8 |
| 44465.916666666664 | 7.8 |
| 44465.927083333336 | 7.8 |
| 44465.9375 | 7.81 |
| 44465.947916666664 | 7.81 |
| 44465.958333333336 | 7.81 |
| 44465.96875 | 7.81 |
| 44465.979166666664 | 7.8 |
| 44465.989583333336 | 7.8 |
| 44466.0 | 7.75 |
| 44466.010416666664 | 7.64 |
| 44466.020833333336 | 7.53 |
| 44466.03125 | 7.62 |
| 44466.041666666664 | 7.63 |
| 44466.052083333336 | 7.65 |
| 44466.0625 | 7.64 |
| 44466.072916666664 | 7.66 |
| 44466.083333333336 | 7.68 |
| 44466.09375 | 7.7 |
| 44466.104166666664 | 7.72 |
| 44466.114583333336 | 7.73 |
| 44466.125 | 7.71 |
| 44466.135416666664 | 7.71 |
| 44466.145833333336 | 7.71 |
| 44466.15625 | 7.7 |
| 44466.166666666664 | 7.69 |
| 44466.177083333336 | 7.67 |
| 44466.1875 | 7.68 |
| 44466.197916666664 | 7.65 |
| 44466.208333333336 | 7.67 |
| 44466.21875 | 7.64 |
| 44466.229166666664 | 7.66 |
| 44466.239583333336 | 7.69 |
| 44466.25 | 7.69 |
| 44466.260416666664 | 7.76 |
| 44466.270833333336 | 7.74 |
| 44466.28125 | 7.73 |
| 44466.291666666664 | 7.75 |
| 44466.302083333336 | 7.75 |
| 44466.3125 | 7.72 |
| 44466.322916666664 | 7.73 |
| 44466.333333333336 | 7.74 |
| 44466.34375 | 7.7 |
| 44466.354166666664 | 7.71 |
| 44466.364583333336 | 7.72 |
| 44466.375 | 7.7 |
| 44466.385416666664 | 7.7 |
| 44466.395833333336 | 7.71 |
| 44466.40625 | 7.71 |
| 44466.416666666664 | 7.71 |
| 44466.427083333336 | 7.71 |
| 44466.4375 | 7.7 |
| 44466.447916666664 | 7.71 |
| 44466.458333333336 | 7.7 |
| 44466.46875 | 7.7 |
| 44466.479166666664 | 7.7 |
| 44466.489583333336 | 7.69 |
| 44466.5 | 7.65 |
| 44466.510416666664 | 7.6 |
| 44466.520833333336 | 7.66 |
| 44466.53125 | 7.65 |
| 44466.541666666664 | 7.67 |
| 44466.552083333336 | 7.67 |
| 44466.5625 | 7.67 |
| 44466.572916666664 | 7.68 |
| 44466.583333333336 | 7.7 |
| 44466.59375 | 7.71 |
| 44466.604166666664 | 7.71 |
| 44466.614583333336 | 7.72 |
| 44466.625 | 7.72 |
| 44466.635416666664 | 7.73 |
| 44466.645833333336 | 7.73 |
| 44466.65625 | 7.75 |
| 44466.666666666664 | 7.76 |
| 44466.677083333336 | 7.78 |
| 44466.6875 | 7.79 |
| 44466.697916666664 | 7.81 |
| 44466.708333333336 | 7.81 |
| 44466.71875 | 7.83 |
| 44466.729166666664 | 7.83 |
| 44466.739583333336 | 7.84 |
| 44466.75 | 7.84 |
| 44466.760416666664 | 7.84 |
| 44466.770833333336 | 7.81 |
| 44466.78125 | 7.85 |
| 44466.791666666664 | 7.83 |
| 44466.802083333336 | 7.83 |
| 44466.8125 | 7.83 |
| 44466.822916666664 | 7.83 |
| 44466.833333333336 | 7.83 |
| 44466.84375 | 7.82 |
| 44466.854166666664 | 7.8 |
| 44466.864583333336 | 7.83 |
| 44466.875 | 7.82 |
| 44466.885416666664 | 7.82 |
| 44466.895833333336 | 7.82 |
| 44466.90625 | 7.82 |
| 44466.916666666664 | 7.82 |
| 44466.927083333336 | 7.82 |
| 44466.9375 | 7.83 |
| 44466.947916666664 | 7.82 |
| 44466.958333333336 | 7.83 |
| 44466.96875 | 7.84 |
| 44466.979166666664 | 7.84 |
| 44466.989583333336 | 7.84 |
| 44467.0 | 7.84 |
| 44467.010416666664 | 7.83 |
| 44467.020833333336 | 7.83 |
| 44467.03125 | 7.78 |
| 44467.041666666664 | 7.65 |
| 44467.052083333336 | 7.41 |
| 44467.0625 | 7.51 |
| 44467.072916666664 | 7.58 |
| 44467.083333333336 | 7.63 |
| 44467.09375 | 7.6 |
| 44467.104166666664 | 7.56 |
| 44467.114583333336 | 7.57 |
| 44467.125 | 7.59 |
| 44467.135416666664 | 7.63 |
| 44467.145833333336 | 7.64 |
| 44467.15625 | 7.65 |
| 44467.166666666664 | 7.69 |
| 44467.177083333336 | 7.68 |
| 44467.1875 | 7.68 |
| 44467.197916666664 | 7.68 |
| 44467.208333333336 | 7.66 |
| 44467.21875 | 7.62 |
| 44467.229166666664 | 7.62 |
| 44467.239583333336 | 7.66 |
| 44467.25 | 7.68 |
| 44467.260416666664 | 7.71 |
| 44467.270833333336 | 7.68 |
| 44467.28125 | 7.72 |
| 44467.291666666664 | 7.75 |
| 44467.302083333336 | 7.77 |
| 44467.3125 | 7.75 |
| 44467.322916666664 | 7.74 |
| 44467.333333333336 | 7.74 |
| 44467.34375 | 7.75 |
| 44467.354166666664 | 7.72 |
| 44467.364583333336 | 7.74 |
| 44467.375 | 7.76 |
| 44467.385416666664 | 7.76 |
| 44467.395833333336 | 7.74 |
| 44467.40625 | 7.73 |
| 44467.416666666664 | 7.75 |
| 44467.427083333336 | 7.75 |
| 44467.4375 | 7.74 |
| 44467.447916666664 | 7.72 |
| 44467.458333333336 | 7.73 |
| 44467.46875 | 7.72 |
| 44467.479166666664 | 7.73 |
| 44467.489583333336 | 7.72 |
| 44467.5 | 7.73 |
| 44467.510416666664 | 7.73 |
| 44467.520833333336 | 7.71 |
| 44467.53125 | 7.65 |
| 44467.541666666664 | 7.68 |
| 44467.552083333336 | 7.69 |
| 44467.5625 | 7.69 |
| 44467.572916666664 | 7.68 |
| 44467.583333333336 | 7.69 |
| 44467.59375 | 7.69 |
| 44467.604166666664 | 7.7 |
| 44467.614583333336 | 7.71 |
| 44467.625 | 7.73 |
| 44467.635416666664 | 7.74 |
| 44467.645833333336 | 7.75 |
| 44467.65625 | 7.76 |
| 44467.666666666664 | 7.77 |
| 44467.677083333336 | 7.78 |
| 44467.6875 | 7.81 |
| 44467.697916666664 | 7.82 |
| 44467.708333333336 | 7.83 |
| 44467.71875 | 7.83 |
| 44467.729166666664 | 7.84 |
| 44467.739583333336 | 7.85 |
| 44467.75 | 7.85 |
| 44467.760416666664 | 7.88 |
| 44467.770833333336 | 7.87 |
| 44467.78125 | 7.87 |
| 44467.791666666664 | 7.85 |
| 44467.802083333336 | 7.81 |
| 44467.8125 | 7.88 |
| 44467.822916666664 | 7.87 |
| 44467.833333333336 | 7.9 |
| 44467.84375 | 7.9 |
| 44467.854166666664 | 7.88 |
| 44467.864583333336 | 7.87 |
| 44467.875 | 7.86 |
| 44467.885416666664 | 7.85 |
| 44467.895833333336 | 7.84 |
| 44467.90625 | 7.84 |
| 44467.916666666664 | 7.82 |
| 44467.927083333336 | 7.81 |
| 44467.9375 | 7.82 |
| 44467.947916666664 | 7.81 |
| 44467.958333333336 | 7.82 |
| 44467.96875 | 7.81 |
| 44467.979166666664 | 7.81 |
| 44467.989583333336 | 7.81 |
| 44468.0 | 7.81 |
| 44468.010416666664 | 7.81 |
| 44468.020833333336 | 7.82 |
| 44468.03125 | 7.81 |
| 44468.041666666664 | 7.81 |
| 44468.052083333336 | 7.81 |
| 44468.0625 | 7.67 |
| 44468.072916666664 | 7.44 |
| 44468.083333333336 | 7.48 |
| 44468.09375 | 7.53 |
| 44468.104166666664 | 7.59 |
| 44468.114583333336 | 7.57 |
| 44468.125 | 7.56 |
| 44468.135416666664 | 7.6 |
| 44468.145833333336 | 7.63 |
| 44468.15625 | 7.64 |
| 44468.166666666664 | 7.68 |
| 44468.177083333336 | 7.71 |
| 44468.1875 | 7.73 |
| 44468.197916666664 | 7.72 |
| 44468.208333333336 | 7.73 |
| 44468.21875 | 7.72 |
| 44468.229166666664 | 7.72 |
| 44468.239583333336 | 7.7 |
| 44468.25 | 7.7 |
| 44468.260416666664 | 7.67 |
| 44468.270833333336 | 7.67 |
| 44468.28125 | 7.67 |
| 44468.291666666664 | 7.72 |
| 44468.302083333336 | 7.77 |
| 44468.3125 | 7.73 |
| 44468.322916666664 | 7.72 |
| 44468.333333333336 | 7.73 |
| 44468.34375 | 7.68 |
| 44468.354166666664 | 7.68 |
| 44468.364583333336 | 7.67 |
| 44468.375 | 7.65 |
| 44468.385416666664 | 7.68 |
| 44468.395833333336 | 7.65 |
| 44468.40625 | 7.69 |
| 44468.416666666664 | 7.66 |
| 44468.427083333336 | 7.67 |
| 44468.4375 | 7.71 |
| 44468.447916666664 | 7.67 |
| 44468.458333333336 | 7.67 |
| 44468.46875 | 7.69 |
| 44468.479166666664 | 7.67 |
| 44468.489583333336 | 7.7 |
| 44468.5 | 7.69 |
| 44468.510416666664 | 7.7 |
| 44468.520833333336 | 7.7 |
| 44468.53125 | 7.69 |
| 44468.541666666664 | 7.7 |
| 44468.552083333336 | 7.69 |
| 44468.5625 | 7.66 |
| 44468.572916666664 | 7.65 |
| 44468.583333333336 | 7.65 |
| 44468.59375 | 7.65 |
| 44468.604166666664 | 7.66 |
| 44468.614583333336 | 7.67 |
| 44468.625 | 7.68 |
| 44468.635416666664 | 7.69 |
| 44468.645833333336 | 7.72 |
| 44468.65625 | 7.74 |
| 44468.666666666664 | 7.75 |
| 44468.677083333336 | 7.77 |
| 44468.6875 | 7.78 |
| 44468.697916666664 | 7.8 |
| 44468.708333333336 | 7.81 |
| 44468.71875 | 7.81 |
| 44468.729166666664 | 7.82 |
| 44468.739583333336 | 7.83 |
| 44468.75 | 7.83 |
| 44468.760416666664 | 7.84 |
| 44468.770833333336 | 7.84 |
| 44468.78125 | 7.85 |
| 44468.791666666664 | 7.85 |
| 44468.802083333336 | 7.85 |
| 44468.8125 | 7.86 |
| 44468.822916666664 | 7.84 |
| 44468.833333333336 | 7.81 |
| 44468.84375 | 7.84 |
| 44468.854166666664 | 7.86 |
| 44468.864583333336 | 7.87 |
| 44468.875 | 7.87 |
| 44468.885416666664 | 7.88 |
| 44468.895833333336 | 7.88 |
| 44468.90625 | 7.87 |
| 44468.916666666664 | 7.87 |
| 44468.927083333336 | 7.86 |
| 44468.9375 | 7.86 |
| 44468.947916666664 | 7.83 |
| 44468.958333333336 | 7.82 |
| 44468.96875 | 7.81 |
| 44468.979166666664 | 7.81 |
| 44468.989583333336 | 7.79 |
| 44469.0 | 7.79 |
| 44469.010416666664 | 7.77 |
| 44469.020833333336 | 7.76 |
| 44469.03125 | 7.79 |
| 44469.041666666664 | 7.79 |
| 44469.052083333336 | 7.81 |
| 44469.0625 | 7.8 |
| 44469.072916666664 | 7.8 |
| 44469.083333333336 | 7.8 |
| 44469.09375 | 7.8 |
| 44469.104166666664 | 7.79 |
| 44469.114583333336 | 7.71 |
| 44469.125 | 7.55 |
| 44469.135416666664 | 7.59 |
| 44469.145833333336 | 7.67 |
| 44469.15625 | 7.69 |
| 44469.166666666664 | 7.68 |
| 44469.177083333336 | 7.69 |
| 44469.1875 | 7.71 |
| 44469.197916666664 | 7.72 |
| 44469.208333333336 | 7.7 |
| 44469.21875 | 7.71 |
| 44469.229166666664 | 7.72 |
| 44469.239583333336 | 7.71 |
| 44469.25 | 7.71 |
| 44469.260416666664 | 7.68 |
| 44469.270833333336 | 7.69 |
| 44469.28125 | 7.7 |
| 44469.291666666664 | 7.68 |
| 44469.302083333336 | 7.66 |
| 44469.3125 | 7.65 |
| 44469.322916666664 | 7.65 |
| 44469.333333333336 | 7.65 |
| 44469.34375 | 7.67 |
| 44469.354166666664 | 7.7 |
| 44469.364583333336 | 7.78 |
| 44469.375 | 7.76 |
| 44469.385416666664 | 7.78 |
| 44469.395833333336 | 7.78 |
| 44469.40625 | 7.75 |
| 44469.416666666664 | 7.76 |
| 44469.427083333336 | 7.74 |
| 44469.4375 | 7.74 |
| 44469.447916666664 | 7.74 |
| 44469.458333333336 | 7.71 |
| 44469.46875 | 7.71 |
| 44469.479166666664 | 7.7 |
| 44469.489583333336 | 7.69 |
| 44469.5 | 7.7 |
| 44469.510416666664 | 7.7 |
| 44469.520833333336 | 7.7 |
| 44469.53125 | 7.7 |
| 44469.541666666664 | 7.7 |
| 44469.552083333336 | 7.69 |
| 44469.5625 | 7.69 |
| 44469.572916666664 | 7.69 |
| 44469.583333333336 | 7.69 |
| 44469.59375 | 7.68 |
| 44469.604166666664 | 7.69 |
| 44469.614583333336 | 7.68 |
| 44469.625 | 7.69 |
| 44469.635416666664 | 7.7 |
| 44469.645833333336 | 7.69 |
| 44469.65625 | 7.7 |
| 44469.666666666664 | 7.73 |
| 44469.677083333336 | 7.75 |
| 44469.6875 | 7.76 |
| 44469.697916666664 | 7.78 |
| 44469.708333333336 | 7.78 |
| 44469.71875 | 7.78 |
| 44469.729166666664 | 7.79 |
| 44469.739583333336 | 7.79 |
| 44469.75 | 7.83 |
| 44469.760416666664 | 7.82 |
| 44469.770833333336 | 7.83 |
| 44469.78125 | 7.84 |
| 44469.791666666664 | 7.84 |
| 44469.802083333336 | 7.85 |
| 44469.8125 | 7.87 |
| 44469.822916666664 | 7.89 |
| 44469.833333333336 | 7.9 |
| 44469.84375 | 7.9 |
| 44469.854166666664 | 7.9 |
| 44469.864583333336 | 7.91 |
| 44469.875 | 7.92 |
| 44469.885416666664 | 7.91 |
| 44469.895833333336 | 7.91 |
| 44469.90625 | 7.89 |
| 44469.916666666664 | 7.87 |
| 44469.927083333336 | 7.86 |
| 44469.9375 | 7.86 |
| 44469.947916666664 | 7.85 |
| 44469.958333333336 | 7.84 |
| 44469.96875 | 7.82 |
| 44469.979166666664 | 7.78 |
| 44469.989583333336 | 7.77 |
| 44470.0 | 7.77 |
| 44470.010416666664 | 7.76 |
| 44470.020833333336 | 7.76 |
| 44470.03125 | 7.75 |
| 44470.041666666664 | 7.74 |
| 44470.052083333336 | 7.74 |
| 44470.0625 | 7.73 |
| 44470.072916666664 | 7.76 |
| 44470.083333333336 | 7.73 |
| 44470.09375 | 7.76 |
| 44470.104166666664 | 7.74 |
| 44470.114583333336 | 7.75 |
| 44470.125 | 7.75 |
| 44470.135416666664 | 7.65 |
| 44470.145833333336 | 7.61 |
| 44470.15625 | 7.63 |